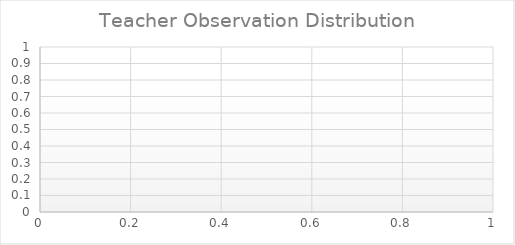
| Category | Distribution |
|---|---|
| #N/A | 0 |
| #N/A | 0 |
| #N/A | 0 |
| #N/A | 0 |
| #N/A | 0 |
| #N/A | 0 |
| #N/A | 0 |
| #N/A | 0 |
| #N/A | 0 |
| #N/A | 0 |
| #N/A | 0 |
| #N/A | 0 |
| #N/A | 0 |
| #N/A | 0 |
| #N/A | 0 |
| #N/A | 0 |
| #N/A | 0 |
| #N/A | 0 |
| #N/A | 0 |
| #N/A | 0 |
| #N/A | 0 |
| #N/A | 0 |
| #N/A | 0 |
| #N/A | 0 |
| #N/A | 0 |
| #N/A | 0 |
| #N/A | 0 |
| #N/A | 0 |
| #N/A | 0 |
| #N/A | 0 |
| #N/A | 0 |
| #N/A | 0 |
| #N/A | 0 |
| #N/A | 0 |
| #N/A | 0 |
| #N/A | 0 |
| #N/A | 0 |
| #N/A | 0 |
| #N/A | 0 |
| #N/A | 0 |
| #N/A | 0 |
| #N/A | 0 |
| #N/A | 0 |
| #N/A | 0 |
| #N/A | 0 |
| #N/A | 0 |
| #N/A | 0 |
| #N/A | 0 |
| #N/A | 0 |
| #N/A | 0 |
| #N/A | 0 |
| #N/A | 0 |
| #N/A | 0 |
| #N/A | 0 |
| #N/A | 0 |
| #N/A | 0 |
| #N/A | 0 |
| #N/A | 0 |
| #N/A | 0 |
| #N/A | 0 |
| #N/A | 0 |
| #N/A | 0 |
| #N/A | 0 |
| #N/A | 0 |
| #N/A | 0 |
| #N/A | 0 |
| #N/A | 0 |
| #N/A | 0 |
| #N/A | 0 |
| #N/A | 0 |
| #N/A | 0 |
| #N/A | 0 |
| #N/A | 0 |
| #N/A | 0 |
| #N/A | 0 |
| #N/A | 0 |
| #N/A | 0 |
| #N/A | 0 |
| #N/A | 0 |
| #N/A | 0 |
| #N/A | 0 |
| #N/A | 0 |
| #N/A | 0 |
| #N/A | 0 |
| #N/A | 0 |
| #N/A | 0 |
| #N/A | 0 |
| #N/A | 0 |
| #N/A | 0 |
| #N/A | 0 |
| #N/A | 0 |
| #N/A | 0 |
| #N/A | 0 |
| #N/A | 0 |
| #N/A | 0 |
| #N/A | 0 |
| #N/A | 0 |
| #N/A | 0 |
| #N/A | 0 |
| #N/A | 0 |
| #N/A | 0 |
| #N/A | 0 |
| #N/A | 0 |
| #N/A | 0 |
| #N/A | 0 |
| #N/A | 0 |
| #N/A | 0 |
| #N/A | 0 |
| #N/A | 0 |
| #N/A | 0 |
| #N/A | 0 |
| #N/A | 0 |
| #N/A | 0 |
| #N/A | 0 |
| #N/A | 0 |
| #N/A | 0 |
| #N/A | 0 |
| #N/A | 0 |
| #N/A | 0 |
| #N/A | 0 |
| #N/A | 0 |
| #N/A | 0 |
| #N/A | 0 |
| #N/A | 0 |
| #N/A | 0 |
| #N/A | 0 |
| #N/A | 0 |
| #N/A | 0 |
| #N/A | 0 |
| #N/A | 0 |
| #N/A | 0 |
| #N/A | 0 |
| #N/A | 0 |
| #N/A | 0 |
| #N/A | 0 |
| #N/A | 0 |
| #N/A | 0 |
| #N/A | 0 |
| #N/A | 0 |
| #N/A | 0 |
| #N/A | 0 |
| #N/A | 0 |
| #N/A | 0 |
| #N/A | 0 |
| #N/A | 0 |
| #N/A | 0 |
| #N/A | 0 |
| #N/A | 0 |
| #N/A | 0 |
| #N/A | 0 |
| #N/A | 0 |
| #N/A | 0 |
| #N/A | 0 |
| #N/A | 0 |
| #N/A | 0 |
| #N/A | 0 |
| #N/A | 0 |
| #N/A | 0 |
| #N/A | 0 |
| #N/A | 0 |
| #N/A | 0 |
| #N/A | 0 |
| #N/A | 0 |
| #N/A | 0 |
| #N/A | 0 |
| #N/A | 0 |
| #N/A | 0 |
| #N/A | 0 |
| #N/A | 0 |
| #N/A | 0 |
| #N/A | 0 |
| #N/A | 0 |
| #N/A | 0 |
| #N/A | 0 |
| #N/A | 0 |
| #N/A | 0 |
| #N/A | 0 |
| #N/A | 0 |
| #N/A | 0 |
| #N/A | 0 |
| #N/A | 0 |
| #N/A | 0 |
| #N/A | 0 |
| #N/A | 0 |
| #N/A | 0 |
| #N/A | 0 |
| #N/A | 0 |
| #N/A | 0 |
| #N/A | 0 |
| #N/A | 0 |
| #N/A | 0 |
| #N/A | 0 |
| #N/A | 0 |
| #N/A | 0 |
| #N/A | 0 |
| #N/A | 0 |
| #N/A | 0 |
| #N/A | 0 |
| #N/A | 0 |
| #N/A | 0 |
| #N/A | 0 |
| #N/A | 0 |
| #N/A | 0 |
| #N/A | 0 |
| #N/A | 0 |
| #N/A | 0 |
| #N/A | 0 |
| #N/A | 0 |
| #N/A | 0 |
| #N/A | 0 |
| #N/A | 0 |
| #N/A | 0 |
| #N/A | 0 |
| #N/A | 0 |
| #N/A | 0 |
| #N/A | 0 |
| #N/A | 0 |
| #N/A | 0 |
| #N/A | 0 |
| #N/A | 0 |
| #N/A | 0 |
| #N/A | 0 |
| #N/A | 0 |
| #N/A | 0 |
| #N/A | 0 |
| #N/A | 0 |
| #N/A | 0 |
| #N/A | 0 |
| #N/A | 0 |
| #N/A | 0 |
| #N/A | 0 |
| #N/A | 0 |
| #N/A | 0 |
| #N/A | 0 |
| #N/A | 0 |
| #N/A | 0 |
| #N/A | 0 |
| #N/A | 0 |
| #N/A | 0 |
| #N/A | 0 |
| #N/A | 0 |
| #N/A | 0 |
| #N/A | 0 |
| #N/A | 0 |
| #N/A | 0 |
| #N/A | 0 |
| #N/A | 0 |
| #N/A | 0 |
| #N/A | 0 |
| #N/A | 0 |
| #N/A | 0 |
| #N/A | 0 |
| #N/A | 0 |
| #N/A | 0 |
| #N/A | 0 |
| #N/A | 0 |
| #N/A | 0 |
| #N/A | 0 |
| #N/A | 0 |
| #N/A | 0 |
| #N/A | 0 |
| #N/A | 0 |
| #N/A | 0 |
| #N/A | 0 |
| #N/A | 0 |
| #N/A | 0 |
| #N/A | 0 |
| #N/A | 0 |
| #N/A | 0 |
| #N/A | 0 |
| #N/A | 0 |
| #N/A | 0 |
| #N/A | 0 |
| #N/A | 0 |
| #N/A | 0 |
| #N/A | 0 |
| #N/A | 0 |
| #N/A | 0 |
| #N/A | 0 |
| #N/A | 0 |
| #N/A | 0 |
| #N/A | 0 |
| #N/A | 0 |
| #N/A | 0 |
| #N/A | 0 |
| #N/A | 0 |
| #N/A | 0 |
| #N/A | 0 |
| #N/A | 0 |
| #N/A | 0 |
| #N/A | 0 |
| #N/A | 0 |
| #N/A | 0 |
| #N/A | 0 |
| #N/A | 0 |
| #N/A | 0 |
| #N/A | 0 |
| #N/A | 0 |
| #N/A | 0 |
| #N/A | 0 |
| #N/A | 0 |
| #N/A | 0 |
| #N/A | 0 |
| #N/A | 0 |
| #N/A | 0 |
| #N/A | 0 |
| #N/A | 0 |
| #N/A | 0 |
| #N/A | 0 |
| #N/A | 0 |
| #N/A | 0 |
| #N/A | 0 |
| #N/A | 0 |
| #N/A | 0 |
| #N/A | 0 |
| #N/A | 0 |
| #N/A | 0 |
| #N/A | 0 |
| #N/A | 0 |
| #N/A | 0 |
| #N/A | 0 |
| #N/A | 0 |
| #N/A | 0 |
| #N/A | 0 |
| #N/A | 0 |
| #N/A | 0 |
| #N/A | 0 |
| #N/A | 0 |
| #N/A | 0 |
| #N/A | 0 |
| #N/A | 0 |
| #N/A | 0 |
| #N/A | 0 |
| #N/A | 0 |
| #N/A | 0 |
| #N/A | 0 |
| #N/A | 0 |
| #N/A | 0 |
| #N/A | 0 |
| #N/A | 0 |
| #N/A | 0 |
| #N/A | 0 |
| #N/A | 0 |
| #N/A | 0 |
| #N/A | 0 |
| #N/A | 0 |
| #N/A | 0 |
| #N/A | 0 |
| #N/A | 0 |
| #N/A | 0 |
| #N/A | 0 |
| #N/A | 0 |
| #N/A | 0 |
| #N/A | 0 |
| #N/A | 0 |
| #N/A | 0 |
| #N/A | 0 |
| #N/A | 0 |
| #N/A | 0 |
| #N/A | 0 |
| #N/A | 0 |
| #N/A | 0 |
| #N/A | 0 |
| #N/A | 0 |
| #N/A | 0 |
| #N/A | 0 |
| #N/A | 0 |
| #N/A | 0 |
| #N/A | 0 |
| #N/A | 0 |
| #N/A | 0 |
| #N/A | 0 |
| #N/A | 0 |
| #N/A | 0 |
| #N/A | 0 |
| #N/A | 0 |
| #N/A | 0 |
| #N/A | 0 |
| #N/A | 0 |
| #N/A | 0 |
| #N/A | 0 |
| #N/A | 0 |
| #N/A | 0 |
| #N/A | 0 |
| #N/A | 0 |
| #N/A | 0 |
| #N/A | 0 |
| #N/A | 0 |
| #N/A | 0 |
| #N/A | 0 |
| #N/A | 0 |
| #N/A | 0 |
| #N/A | 0 |
| #N/A | 0 |
| #N/A | 0 |
| #N/A | 0 |
| #N/A | 0 |
| #N/A | 0 |
| #N/A | 0 |
| #N/A | 0 |
| #N/A | 0 |
| #N/A | 0 |
| #N/A | 0 |
| #N/A | 0 |
| #N/A | 0 |
| #N/A | 0 |
| #N/A | 0 |
| #N/A | 0 |
| #N/A | 0 |
| #N/A | 0 |
| #N/A | 0 |
| #N/A | 0 |
| #N/A | 0 |
| #N/A | 0 |
| #N/A | 0 |
| #N/A | 0 |
| #N/A | 0 |
| #N/A | 0 |
| #N/A | 0 |
| #N/A | 0 |
| #N/A | 0 |
| #N/A | 0 |
| #N/A | 0 |
| #N/A | 0 |
| #N/A | 0 |
| #N/A | 0 |
| #N/A | 0 |
| #N/A | 0 |
| #N/A | 0 |
| #N/A | 0 |
| #N/A | 0 |
| #N/A | 0 |
| #N/A | 0 |
| #N/A | 0 |
| #N/A | 0 |
| #N/A | 0 |
| #N/A | 0 |
| #N/A | 0 |
| #N/A | 0 |
| #N/A | 0 |
| #N/A | 0 |
| #N/A | 0 |
| #N/A | 0 |
| #N/A | 0 |
| #N/A | 0 |
| #N/A | 0 |
| #N/A | 0 |
| #N/A | 0 |
| #N/A | 0 |
| #N/A | 0 |
| #N/A | 0 |
| #N/A | 0 |
| #N/A | 0 |
| #N/A | 0 |
| #N/A | 0 |
| #N/A | 0 |
| #N/A | 0 |
| #N/A | 0 |
| #N/A | 0 |
| #N/A | 0 |
| #N/A | 0 |
| #N/A | 0 |
| #N/A | 0 |
| #N/A | 0 |
| #N/A | 0 |
| #N/A | 0 |
| #N/A | 0 |
| #N/A | 0 |
| #N/A | 0 |
| #N/A | 0 |
| #N/A | 0 |
| #N/A | 0 |
| #N/A | 0 |
| #N/A | 0 |
| #N/A | 0 |
| #N/A | 0 |
| #N/A | 0 |
| #N/A | 0 |
| #N/A | 0 |
| #N/A | 0 |
| #N/A | 0 |
| #N/A | 0 |
| #N/A | 0 |
| #N/A | 0 |
| #N/A | 0 |
| #N/A | 0 |
| #N/A | 0 |
| #N/A | 0 |
| #N/A | 0 |
| #N/A | 0 |
| #N/A | 0 |
| #N/A | 0 |
| #N/A | 0 |
| #N/A | 0 |
| #N/A | 0 |
| #N/A | 0 |
| #N/A | 0 |
| #N/A | 0 |
| #N/A | 0 |
| #N/A | 0 |
| #N/A | 0 |
| #N/A | 0 |
| #N/A | 0 |
| #N/A | 0 |
| #N/A | 0 |
| #N/A | 0 |
| #N/A | 0 |
| #N/A | 0 |
| #N/A | 0 |
| #N/A | 0 |
| #N/A | 0 |
| #N/A | 0 |
| #N/A | 0 |
| #N/A | 0 |
| #N/A | 0 |
| #N/A | 0 |
| #N/A | 0 |
| #N/A | 0 |
| #N/A | 0 |
| #N/A | 0 |
| #N/A | 0 |
| #N/A | 0 |
| #N/A | 0 |
| #N/A | 0 |
| #N/A | 0 |
| #N/A | 0 |
| #N/A | 0 |
| #N/A | 0 |
| #N/A | 0 |
| #N/A | 0 |
| #N/A | 0 |
| #N/A | 0 |
| #N/A | 0 |
| #N/A | 0 |
| #N/A | 0 |
| #N/A | 0 |
| #N/A | 0 |
| #N/A | 0 |
| #N/A | 0 |
| #N/A | 0 |
| #N/A | 0 |
| #N/A | 0 |
| #N/A | 0 |
| #N/A | 0 |
| #N/A | 0 |
| #N/A | 0 |
| #N/A | 0 |
| #N/A | 0 |
| #N/A | 0 |
| #N/A | 0 |
| #N/A | 0 |
| #N/A | 0 |
| #N/A | 0 |
| #N/A | 0 |
| #N/A | 0 |
| #N/A | 0 |
| #N/A | 0 |
| #N/A | 0 |
| #N/A | 0 |
| #N/A | 0 |
| #N/A | 0 |
| #N/A | 0 |
| #N/A | 0 |
| #N/A | 0 |
| #N/A | 0 |
| #N/A | 0 |
| #N/A | 0 |
| #N/A | 0 |
| #N/A | 0 |
| #N/A | 0 |
| #N/A | 0 |
| #N/A | 0 |
| #N/A | 0 |
| #N/A | 0 |
| #N/A | 0 |
| #N/A | 0 |
| #N/A | 0 |
| #N/A | 0 |
| #N/A | 0 |
| #N/A | 0 |
| #N/A | 0 |
| #N/A | 0 |
| #N/A | 0 |
| #N/A | 0 |
| #N/A | 0 |
| #N/A | 0 |
| #N/A | 0 |
| #N/A | 0 |
| #N/A | 0 |
| #N/A | 0 |
| #N/A | 0 |
| #N/A | 0 |
| #N/A | 0 |
| #N/A | 0 |
| #N/A | 0 |
| #N/A | 0 |
| #N/A | 0 |
| #N/A | 0 |
| #N/A | 0 |
| #N/A | 0 |
| #N/A | 0 |
| #N/A | 0 |
| #N/A | 0 |
| #N/A | 0 |
| #N/A | 0 |
| #N/A | 0 |
| #N/A | 0 |
| #N/A | 0 |
| #N/A | 0 |
| #N/A | 0 |
| #N/A | 0 |
| #N/A | 0 |
| #N/A | 0 |
| #N/A | 0 |
| #N/A | 0 |
| #N/A | 0 |
| #N/A | 0 |
| #N/A | 0 |
| #N/A | 0 |
| #N/A | 0 |
| #N/A | 0 |
| #N/A | 0 |
| #N/A | 0 |
| #N/A | 0 |
| #N/A | 0 |
| #N/A | 0 |
| #N/A | 0 |
| #N/A | 0 |
| #N/A | 0 |
| #N/A | 0 |
| #N/A | 0 |
| #N/A | 0 |
| #N/A | 0 |
| #N/A | 0 |
| #N/A | 0 |
| #N/A | 0 |
| #N/A | 0 |
| #N/A | 0 |
| #N/A | 0 |
| #N/A | 0 |
| #N/A | 0 |
| #N/A | 0 |
| #N/A | 0 |
| #N/A | 0 |
| #N/A | 0 |
| #N/A | 0 |
| #N/A | 0 |
| #N/A | 0 |
| #N/A | 0 |
| #N/A | 0 |
| #N/A | 0 |
| #N/A | 0 |
| #N/A | 0 |
| #N/A | 0 |
| #N/A | 0 |
| #N/A | 0 |
| #N/A | 0 |
| #N/A | 0 |
| #N/A | 0 |
| #N/A | 0 |
| #N/A | 0 |
| #N/A | 0 |
| #N/A | 0 |
| #N/A | 0 |
| #N/A | 0 |
| #N/A | 0 |
| #N/A | 0 |
| #N/A | 0 |
| #N/A | 0 |
| #N/A | 0 |
| #N/A | 0 |
| #N/A | 0 |
| #N/A | 0 |
| #N/A | 0 |
| #N/A | 0 |
| #N/A | 0 |
| #N/A | 0 |
| #N/A | 0 |
| #N/A | 0 |
| #N/A | 0 |
| #N/A | 0 |
| #N/A | 0 |
| #N/A | 0 |
| #N/A | 0 |
| #N/A | 0 |
| #N/A | 0 |
| #N/A | 0 |
| #N/A | 0 |
| #N/A | 0 |
| #N/A | 0 |
| #N/A | 0 |
| #N/A | 0 |
| #N/A | 0 |
| #N/A | 0 |
| #N/A | 0 |
| #N/A | 0 |
| #N/A | 0 |
| #N/A | 0 |
| #N/A | 0 |
| #N/A | 0 |
| #N/A | 0 |
| #N/A | 0 |
| #N/A | 0 |
| #N/A | 0 |
| #N/A | 0 |
| #N/A | 0 |
| #N/A | 0 |
| #N/A | 0 |
| #N/A | 0 |
| #N/A | 0 |
| #N/A | 0 |
| #N/A | 0 |
| #N/A | 0 |
| #N/A | 0 |
| #N/A | 0 |
| #N/A | 0 |
| #N/A | 0 |
| #N/A | 0 |
| #N/A | 0 |
| #N/A | 0 |
| #N/A | 0 |
| #N/A | 0 |
| #N/A | 0 |
| #N/A | 0 |
| #N/A | 0 |
| #N/A | 0 |
| #N/A | 0 |
| #N/A | 0 |
| #N/A | 0 |
| #N/A | 0 |
| #N/A | 0 |
| #N/A | 0 |
| #N/A | 0 |
| #N/A | 0 |
| #N/A | 0 |
| #N/A | 0 |
| #N/A | 0 |
| #N/A | 0 |
| #N/A | 0 |
| #N/A | 0 |
| #N/A | 0 |
| #N/A | 0 |
| #N/A | 0 |
| #N/A | 0 |
| #N/A | 0 |
| #N/A | 0 |
| #N/A | 0 |
| #N/A | 0 |
| #N/A | 0 |
| #N/A | 0 |
| #N/A | 0 |
| #N/A | 0 |
| #N/A | 0 |
| #N/A | 0 |
| #N/A | 0 |
| #N/A | 0 |
| #N/A | 0 |
| #N/A | 0 |
| #N/A | 0 |
| #N/A | 0 |
| #N/A | 0 |
| #N/A | 0 |
| #N/A | 0 |
| #N/A | 0 |
| #N/A | 0 |
| #N/A | 0 |
| #N/A | 0 |
| #N/A | 0 |
| #N/A | 0 |
| #N/A | 0 |
| #N/A | 0 |
| #N/A | 0 |
| #N/A | 0 |
| #N/A | 0 |
| #N/A | 0 |
| #N/A | 0 |
| #N/A | 0 |
| #N/A | 0 |
| #N/A | 0 |
| #N/A | 0 |
| #N/A | 0 |
| #N/A | 0 |
| #N/A | 0 |
| #N/A | 0 |
| #N/A | 0 |
| #N/A | 0 |
| #N/A | 0 |
| #N/A | 0 |
| #N/A | 0 |
| #N/A | 0 |
| #N/A | 0 |
| #N/A | 0 |
| #N/A | 0 |
| #N/A | 0 |
| #N/A | 0 |
| #N/A | 0 |
| #N/A | 0 |
| #N/A | 0 |
| #N/A | 0 |
| #N/A | 0 |
| #N/A | 0 |
| #N/A | 0 |
| #N/A | 0 |
| #N/A | 0 |
| #N/A | 0 |
| #N/A | 0 |
| #N/A | 0 |
| #N/A | 0 |
| #N/A | 0 |
| #N/A | 0 |
| #N/A | 0 |
| #N/A | 0 |
| #N/A | 0 |
| #N/A | 0 |
| #N/A | 0 |
| #N/A | 0 |
| #N/A | 0 |
| #N/A | 0 |
| #N/A | 0 |
| #N/A | 0 |
| #N/A | 0 |
| #N/A | 0 |
| #N/A | 0 |
| #N/A | 0 |
| #N/A | 0 |
| #N/A | 0 |
| #N/A | 0 |
| #N/A | 0 |
| #N/A | 0 |
| #N/A | 0 |
| #N/A | 0 |
| #N/A | 0 |
| #N/A | 0 |
| #N/A | 0 |
| #N/A | 0 |
| #N/A | 0 |
| #N/A | 0 |
| #N/A | 0 |
| #N/A | 0 |
| #N/A | 0 |
| #N/A | 0 |
| #N/A | 0 |
| #N/A | 0 |
| #N/A | 0 |
| #N/A | 0 |
| #N/A | 0 |
| #N/A | 0 |
| #N/A | 0 |
| #N/A | 0 |
| #N/A | 0 |
| #N/A | 0 |
| #N/A | 0 |
| #N/A | 0 |
| #N/A | 0 |
| #N/A | 0 |
| #N/A | 0 |
| #N/A | 0 |
| #N/A | 0 |
| #N/A | 0 |
| #N/A | 0 |
| #N/A | 0 |
| #N/A | 0 |
| #N/A | 0 |
| #N/A | 0 |
| #N/A | 0 |
| #N/A | 0 |
| #N/A | 0 |
| #N/A | 0 |
| #N/A | 0 |
| #N/A | 0 |
| #N/A | 0 |
| #N/A | 0 |
| #N/A | 0 |
| #N/A | 0 |
| #N/A | 0 |
| #N/A | 0 |
| #N/A | 0 |
| #N/A | 0 |
| #N/A | 0 |
| #N/A | 0 |
| #N/A | 0 |
| #N/A | 0 |
| #N/A | 0 |
| #N/A | 0 |
| #N/A | 0 |
| #N/A | 0 |
| #N/A | 0 |
| #N/A | 0 |
| #N/A | 0 |
| #N/A | 0 |
| #N/A | 0 |
| #N/A | 0 |
| #N/A | 0 |
| #N/A | 0 |
| #N/A | 0 |
| #N/A | 0 |
| #N/A | 0 |
| #N/A | 0 |
| #N/A | 0 |
| #N/A | 0 |
| #N/A | 0 |
| #N/A | 0 |
| #N/A | 0 |
| #N/A | 0 |
| #N/A | 0 |
| #N/A | 0 |
| #N/A | 0 |
| #N/A | 0 |
| #N/A | 0 |
| #N/A | 0 |
| #N/A | 0 |
| #N/A | 0 |
| #N/A | 0 |
| #N/A | 0 |
| #N/A | 0 |
| #N/A | 0 |
| #N/A | 0 |
| #N/A | 0 |
| #N/A | 0 |
| #N/A | 0 |
| #N/A | 0 |
| #N/A | 0 |
| #N/A | 0 |
| #N/A | 0 |
| #N/A | 0 |
| #N/A | 0 |
| #N/A | 0 |
| #N/A | 0 |
| #N/A | 0 |
| #N/A | 0 |
| #N/A | 0 |
| #N/A | 0 |
| #N/A | 0 |
| #N/A | 0 |
| #N/A | 0 |
| #N/A | 0 |
| #N/A | 0 |
| #N/A | 0 |
| #N/A | 0 |
| #N/A | 0 |
| #N/A | 0 |
| #N/A | 0 |
| #N/A | 0 |
| #N/A | 0 |
| #N/A | 0 |
| #N/A | 0 |
| #N/A | 0 |
| #N/A | 0 |
| #N/A | 0 |
| #N/A | 0 |
| #N/A | 0 |
| #N/A | 0 |
| #N/A | 0 |
| #N/A | 0 |
| #N/A | 0 |
| #N/A | 0 |
| #N/A | 0 |
| #N/A | 0 |
| #N/A | 0 |
| #N/A | 0 |
| #N/A | 0 |
| #N/A | 0 |
| #N/A | 0 |
| #N/A | 0 |
| #N/A | 0 |
| #N/A | 0 |
| #N/A | 0 |
| #N/A | 0 |
| #N/A | 0 |
| #N/A | 0 |
| #N/A | 0 |
| #N/A | 0 |
| #N/A | 0 |
| #N/A | 0 |
| #N/A | 0 |
| #N/A | 0 |
| #N/A | 0 |
| #N/A | 0 |
| #N/A | 0 |
| #N/A | 0 |
| #N/A | 0 |
| #N/A | 0 |
| #N/A | 0 |
| #N/A | 0 |
| #N/A | 0 |
| #N/A | 0 |
| #N/A | 0 |
| #N/A | 0 |
| #N/A | 0 |
| #N/A | 0 |
| #N/A | 0 |
| #N/A | 0 |
| #N/A | 0 |
| #N/A | 0 |
| #N/A | 0 |
| #N/A | 0 |
| #N/A | 0 |
| #N/A | 0 |
| #N/A | 0 |
| #N/A | 0 |
| #N/A | 0 |
| #N/A | 0 |
| #N/A | 0 |
| #N/A | 0 |
| #N/A | 0 |
| #N/A | 0 |
| #N/A | 0 |
| #N/A | 0 |
| #N/A | 0 |
| #N/A | 0 |
| #N/A | 0 |
| #N/A | 0 |
| #N/A | 0 |
| #N/A | 0 |
| #N/A | 0 |
| #N/A | 0 |
| #N/A | 0 |
| #N/A | 0 |
| #N/A | 0 |
| #N/A | 0 |
| #N/A | 0 |
| #N/A | 0 |
| #N/A | 0 |
| #N/A | 0 |
| #N/A | 0 |
| #N/A | 0 |
| #N/A | 0 |
| #N/A | 0 |
| #N/A | 0 |
| #N/A | 0 |
| #N/A | 0 |
| #N/A | 0 |
| #N/A | 0 |
| #N/A | 0 |
| #N/A | 0 |
| #N/A | 0 |
| #N/A | 0 |
| #N/A | 0 |
| #N/A | 0 |
| #N/A | 0 |
| #N/A | 0 |
| #N/A | 0 |
| #N/A | 0 |
| #N/A | 0 |
| #N/A | 0 |
| #N/A | 0 |
| #N/A | 0 |
| #N/A | 0 |
| #N/A | 0 |
| #N/A | 0 |
| #N/A | 0 |
| #N/A | 0 |
| #N/A | 0 |
| #N/A | 0 |
| #N/A | 0 |
| #N/A | 0 |
| #N/A | 0 |
| #N/A | 0 |
| #N/A | 0 |
| #N/A | 0 |
| #N/A | 0 |
| #N/A | 0 |
| #N/A | 0 |
| #N/A | 0 |
| #N/A | 0 |
| #N/A | 0 |
| #N/A | 0 |
| #N/A | 0 |
| #N/A | 0 |
| #N/A | 0 |
| #N/A | 0 |
| #N/A | 0 |
| #N/A | 0 |
| #N/A | 0 |
| #N/A | 0 |
| #N/A | 0 |
| #N/A | 0 |
| #N/A | 0 |
| #N/A | 0 |
| #N/A | 0 |
| #N/A | 0 |
| #N/A | 0 |
| #N/A | 0 |
| #N/A | 0 |
| #N/A | 0 |
| #N/A | 0 |
| #N/A | 0 |
| #N/A | 0 |
| #N/A | 0 |
| #N/A | 0 |
| #N/A | 0 |
| #N/A | 0 |
| #N/A | 0 |
| #N/A | 0 |
| #N/A | 0 |
| #N/A | 0 |
| #N/A | 0 |
| #N/A | 0 |
| #N/A | 0 |
| #N/A | 0 |
| #N/A | 0 |
| #N/A | 0 |
| #N/A | 0 |
| #N/A | 0 |
| #N/A | 0 |
| #N/A | 0 |
| #N/A | 0 |
| #N/A | 0 |
| #N/A | 0 |
| #N/A | 0 |
| #N/A | 0 |
| #N/A | 0 |
| #N/A | 0 |
| #N/A | 0 |
| #N/A | 0 |
| #N/A | 0 |
| #N/A | 0 |
| #N/A | 0 |
| #N/A | 0 |
| #N/A | 0 |
| #N/A | 0 |
| #N/A | 0 |
| #N/A | 0 |
| #N/A | 0 |
| #N/A | 0 |
| #N/A | 0 |
| #N/A | 0 |
| #N/A | 0 |
| #N/A | 0 |
| #N/A | 0 |
| #N/A | 0 |
| #N/A | 0 |
| #N/A | 0 |
| #N/A | 0 |
| #N/A | 0 |
| #N/A | 0 |
| #N/A | 0 |
| #N/A | 0 |
| #N/A | 0 |
| #N/A | 0 |
| #N/A | 0 |
| #N/A | 0 |
| #N/A | 0 |
| #N/A | 0 |
| #N/A | 0 |
| #N/A | 0 |
| #N/A | 0 |
| #N/A | 0 |
| #N/A | 0 |
| #N/A | 0 |
| #N/A | 0 |
| #N/A | 0 |
| #N/A | 0 |
| #N/A | 0 |
| #N/A | 0 |
| #N/A | 0 |
| #N/A | 0 |
| #N/A | 0 |
| #N/A | 0 |
| #N/A | 0 |
| #N/A | 0 |
| #N/A | 0 |
| #N/A | 0 |
| #N/A | 0 |
| #N/A | 0 |
| #N/A | 0 |
| #N/A | 0 |
| #N/A | 0 |
| #N/A | 0 |
| #N/A | 0 |
| #N/A | 0 |
| #N/A | 0 |
| #N/A | 0 |
| #N/A | 0 |
| #N/A | 0 |
| #N/A | 0 |
| #N/A | 0 |
| #N/A | 0 |
| #N/A | 0 |
| #N/A | 0 |
| #N/A | 0 |
| #N/A | 0 |
| #N/A | 0 |
| #N/A | 0 |
| #N/A | 0 |
| #N/A | 0 |
| #N/A | 0 |
| #N/A | 0 |
| #N/A | 0 |
| #N/A | 0 |
| #N/A | 0 |
| #N/A | 0 |
| #N/A | 0 |
| #N/A | 0 |
| #N/A | 0 |
| #N/A | 0 |
| #N/A | 0 |
| #N/A | 0 |
| #N/A | 0 |
| #N/A | 0 |
| #N/A | 0 |
| #N/A | 0 |
| #N/A | 0 |
| #N/A | 0 |
| #N/A | 0 |
| #N/A | 0 |
| #N/A | 0 |
| #N/A | 0 |
| #N/A | 0 |
| #N/A | 0 |
| #N/A | 0 |
| #N/A | 0 |
| #N/A | 0 |
| #N/A | 0 |
| #N/A | 0 |
| #N/A | 0 |
| #N/A | 0 |
| #N/A | 0 |
| #N/A | 0 |
| #N/A | 0 |
| #N/A | 0 |
| #N/A | 0 |
| #N/A | 0 |
| #N/A | 0 |
| #N/A | 0 |
| #N/A | 0 |
| #N/A | 0 |
| #N/A | 0 |
| #N/A | 0 |
| #N/A | 0 |
| #N/A | 0 |
| #N/A | 0 |
| #N/A | 0 |
| #N/A | 0 |
| #N/A | 0 |
| #N/A | 0 |
| #N/A | 0 |
| #N/A | 0 |
| #N/A | 0 |
| #N/A | 0 |
| #N/A | 0 |
| #N/A | 0 |
| #N/A | 0 |
| #N/A | 0 |
| #N/A | 0 |
| #N/A | 0 |
| #N/A | 0 |
| #N/A | 0 |
| #N/A | 0 |
| #N/A | 0 |
| #N/A | 0 |
| #N/A | 0 |
| #N/A | 0 |
| #N/A | 0 |
| #N/A | 0 |
| #N/A | 0 |
| #N/A | 0 |
| #N/A | 0 |
| #N/A | 0 |
| #N/A | 0 |
| #N/A | 0 |
| #N/A | 0 |
| #N/A | 0 |
| #N/A | 0 |
| #N/A | 0 |
| #N/A | 0 |
| #N/A | 0 |
| #N/A | 0 |
| #N/A | 0 |
| #N/A | 0 |
| #N/A | 0 |
| #N/A | 0 |
| #N/A | 0 |
| #N/A | 0 |
| #N/A | 0 |
| #N/A | 0 |
| #N/A | 0 |
| #N/A | 0 |
| #N/A | 0 |
| #N/A | 0 |
| #N/A | 0 |
| #N/A | 0 |
| #N/A | 0 |
| #N/A | 0 |
| #N/A | 0 |
| #N/A | 0 |
| #N/A | 0 |
| #N/A | 0 |
| #N/A | 0 |
| #N/A | 0 |
| #N/A | 0 |
| #N/A | 0 |
| #N/A | 0 |
| #N/A | 0 |
| #N/A | 0 |
| #N/A | 0 |
| #N/A | 0 |
| #N/A | 0 |
| #N/A | 0 |
| #N/A | 0 |
| #N/A | 0 |
| #N/A | 0 |
| #N/A | 0 |
| #N/A | 0 |
| #N/A | 0 |
| #N/A | 0 |
| #N/A | 0 |
| #N/A | 0 |
| #N/A | 0 |
| #N/A | 0 |
| #N/A | 0 |
| #N/A | 0 |
| #N/A | 0 |
| #N/A | 0 |
| #N/A | 0 |
| #N/A | 0 |
| #N/A | 0 |
| #N/A | 0 |
| #N/A | 0 |
| #N/A | 0 |
| #N/A | 0 |
| #N/A | 0 |
| #N/A | 0 |
| #N/A | 0 |
| #N/A | 0 |
| #N/A | 0 |
| #N/A | 0 |
| #N/A | 0 |
| #N/A | 0 |
| #N/A | 0 |
| #N/A | 0 |
| #N/A | 0 |
| #N/A | 0 |
| #N/A | 0 |
| #N/A | 0 |
| #N/A | 0 |
| #N/A | 0 |
| #N/A | 0 |
| #N/A | 0 |
| #N/A | 0 |
| #N/A | 0 |
| #N/A | 0 |
| #N/A | 0 |
| #N/A | 0 |
| #N/A | 0 |
| #N/A | 0 |
| #N/A | 0 |
| #N/A | 0 |
| #N/A | 0 |
| #N/A | 0 |
| #N/A | 0 |
| #N/A | 0 |
| #N/A | 0 |
| #N/A | 0 |
| #N/A | 0 |
| #N/A | 0 |
| #N/A | 0 |
| #N/A | 0 |
| #N/A | 0 |
| #N/A | 0 |
| #N/A | 0 |
| #N/A | 0 |
| #N/A | 0 |
| #N/A | 0 |
| #N/A | 0 |
| #N/A | 0 |
| #N/A | 0 |
| #N/A | 0 |
| #N/A | 0 |
| #N/A | 0 |
| #N/A | 0 |
| #N/A | 0 |
| #N/A | 0 |
| #N/A | 0 |
| #N/A | 0 |
| #N/A | 0 |
| #N/A | 0 |
| #N/A | 0 |
| #N/A | 0 |
| #N/A | 0 |
| #N/A | 0 |
| #N/A | 0 |
| #N/A | 0 |
| #N/A | 0 |
| #N/A | 0 |
| #N/A | 0 |
| #N/A | 0 |
| #N/A | 0 |
| #N/A | 0 |
| #N/A | 0 |
| #N/A | 0 |
| #N/A | 0 |
| #N/A | 0 |
| #N/A | 0 |
| #N/A | 0 |
| #N/A | 0 |
| #N/A | 0 |
| #N/A | 0 |
| #N/A | 0 |
| #N/A | 0 |
| #N/A | 0 |
| #N/A | 0 |
| #N/A | 0 |
| #N/A | 0 |
| #N/A | 0 |
| #N/A | 0 |
| #N/A | 0 |
| #N/A | 0 |
| #N/A | 0 |
| #N/A | 0 |
| #N/A | 0 |
| #N/A | 0 |
| #N/A | 0 |
| #N/A | 0 |
| #N/A | 0 |
| #N/A | 0 |
| #N/A | 0 |
| #N/A | 0 |
| #N/A | 0 |
| #N/A | 0 |
| #N/A | 0 |
| #N/A | 0 |
| #N/A | 0 |
| #N/A | 0 |
| #N/A | 0 |
| #N/A | 0 |
| #N/A | 0 |
| #N/A | 0 |
| #N/A | 0 |
| #N/A | 0 |
| #N/A | 0 |
| #N/A | 0 |
| #N/A | 0 |
| #N/A | 0 |
| #N/A | 0 |
| #N/A | 0 |
| #N/A | 0 |
| #N/A | 0 |
| #N/A | 0 |
| #N/A | 0 |
| #N/A | 0 |
| #N/A | 0 |
| #N/A | 0 |
| #N/A | 0 |
| #N/A | 0 |
| #N/A | 0 |
| #N/A | 0 |
| #N/A | 0 |
| #N/A | 0 |
| #N/A | 0 |
| #N/A | 0 |
| #N/A | 0 |
| #N/A | 0 |
| #N/A | 0 |
| #N/A | 0 |
| #N/A | 0 |
| #N/A | 0 |
| #N/A | 0 |
| #N/A | 0 |
| #N/A | 0 |
| #N/A | 0 |
| #N/A | 0 |
| #N/A | 0 |
| #N/A | 0 |
| #N/A | 0 |
| #N/A | 0 |
| #N/A | 0 |
| #N/A | 0 |
| #N/A | 0 |
| #N/A | 0 |
| #N/A | 0 |
| #N/A | 0 |
| #N/A | 0 |
| #N/A | 0 |
| #N/A | 0 |
| #N/A | 0 |
| #N/A | 0 |
| #N/A | 0 |
| #N/A | 0 |
| #N/A | 0 |
| #N/A | 0 |
| #N/A | 0 |
| #N/A | 0 |
| #N/A | 0 |
| #N/A | 0 |
| #N/A | 0 |
| #N/A | 0 |
| #N/A | 0 |
| #N/A | 0 |
| #N/A | 0 |
| #N/A | 0 |
| #N/A | 0 |
| #N/A | 0 |
| #N/A | 0 |
| #N/A | 0 |
| #N/A | 0 |
| #N/A | 0 |
| #N/A | 0 |
| #N/A | 0 |
| #N/A | 0 |
| #N/A | 0 |
| #N/A | 0 |
| #N/A | 0 |
| #N/A | 0 |
| #N/A | 0 |
| #N/A | 0 |
| #N/A | 0 |
| #N/A | 0 |
| #N/A | 0 |
| #N/A | 0 |
| #N/A | 0 |
| #N/A | 0 |
| #N/A | 0 |
| #N/A | 0 |
| #N/A | 0 |
| #N/A | 0 |
| #N/A | 0 |
| #N/A | 0 |
| #N/A | 0 |
| #N/A | 0 |
| #N/A | 0 |
| #N/A | 0 |
| #N/A | 0 |
| #N/A | 0 |
| #N/A | 0 |
| #N/A | 0 |
| #N/A | 0 |
| #N/A | 0 |
| #N/A | 0 |
| #N/A | 0 |
| #N/A | 0 |
| #N/A | 0 |
| #N/A | 0 |
| #N/A | 0 |
| #N/A | 0 |
| #N/A | 0 |
| #N/A | 0 |
| #N/A | 0 |
| #N/A | 0 |
| #N/A | 0 |
| #N/A | 0 |
| #N/A | 0 |
| #N/A | 0 |
| #N/A | 0 |
| #N/A | 0 |
| #N/A | 0 |
| #N/A | 0 |
| #N/A | 0 |
| #N/A | 0 |
| #N/A | 0 |
| #N/A | 0 |
| #N/A | 0 |
| #N/A | 0 |
| #N/A | 0 |
| #N/A | 0 |
| #N/A | 0 |
| #N/A | 0 |
| #N/A | 0 |
| #N/A | 0 |
| #N/A | 0 |
| #N/A | 0 |
| #N/A | 0 |
| #N/A | 0 |
| #N/A | 0 |
| #N/A | 0 |
| #N/A | 0 |
| #N/A | 0 |
| #N/A | 0 |
| #N/A | 0 |
| #N/A | 0 |
| #N/A | 0 |
| #N/A | 0 |
| #N/A | 0 |
| #N/A | 0 |
| #N/A | 0 |
| #N/A | 0 |
| #N/A | 0 |
| #N/A | 0 |
| #N/A | 0 |
| #N/A | 0 |
| #N/A | 0 |
| #N/A | 0 |
| #N/A | 0 |
| #N/A | 0 |
| #N/A | 0 |
| #N/A | 0 |
| #N/A | 0 |
| #N/A | 0 |
| #N/A | 0 |
| #N/A | 0 |
| #N/A | 0 |
| #N/A | 0 |
| #N/A | 0 |
| #N/A | 0 |
| #N/A | 0 |
| #N/A | 0 |
| #N/A | 0 |
| #N/A | 0 |
| #N/A | 0 |
| #N/A | 0 |
| #N/A | 0 |
| #N/A | 0 |
| #N/A | 0 |
| #N/A | 0 |
| #N/A | 0 |
| #N/A | 0 |
| #N/A | 0 |
| #N/A | 0 |
| #N/A | 0 |
| #N/A | 0 |
| #N/A | 0 |
| #N/A | 0 |
| #N/A | 0 |
| #N/A | 0 |
| #N/A | 0 |
| #N/A | 0 |
| #N/A | 0 |
| #N/A | 0 |
| #N/A | 0 |
| #N/A | 0 |
| #N/A | 0 |
| #N/A | 0 |
| #N/A | 0 |
| #N/A | 0 |
| #N/A | 0 |
| #N/A | 0 |
| #N/A | 0 |
| #N/A | 0 |
| #N/A | 0 |
| #N/A | 0 |
| #N/A | 0 |
| #N/A | 0 |
| #N/A | 0 |
| #N/A | 0 |
| #N/A | 0 |
| #N/A | 0 |
| #N/A | 0 |
| #N/A | 0 |
| #N/A | 0 |
| #N/A | 0 |
| #N/A | 0 |
| #N/A | 0 |
| #N/A | 0 |
| #N/A | 0 |
| #N/A | 0 |
| #N/A | 0 |
| #N/A | 0 |
| #N/A | 0 |
| #N/A | 0 |
| #N/A | 0 |
| #N/A | 0 |
| #N/A | 0 |
| #N/A | 0 |
| #N/A | 0 |
| #N/A | 0 |
| #N/A | 0 |
| #N/A | 0 |
| #N/A | 0 |
| #N/A | 0 |
| #N/A | 0 |
| #N/A | 0 |
| #N/A | 0 |
| #N/A | 0 |
| #N/A | 0 |
| #N/A | 0 |
| #N/A | 0 |
| #N/A | 0 |
| #N/A | 0 |
| #N/A | 0 |
| #N/A | 0 |
| #N/A | 0 |
| #N/A | 0 |
| #N/A | 0 |
| #N/A | 0 |
| #N/A | 0 |
| #N/A | 0 |
| #N/A | 0 |
| #N/A | 0 |
| #N/A | 0 |
| #N/A | 0 |
| #N/A | 0 |
| #N/A | 0 |
| #N/A | 0 |
| #N/A | 0 |
| #N/A | 0 |
| #N/A | 0 |
| #N/A | 0 |
| #N/A | 0 |
| #N/A | 0 |
| #N/A | 0 |
| #N/A | 0 |
| #N/A | 0 |
| #N/A | 0 |
| #N/A | 0 |
| #N/A | 0 |
| #N/A | 0 |
| #N/A | 0 |
| #N/A | 0 |
| #N/A | 0 |
| #N/A | 0 |
| #N/A | 0 |
| #N/A | 0 |
| #N/A | 0 |
| #N/A | 0 |
| #N/A | 0 |
| #N/A | 0 |
| #N/A | 0 |
| #N/A | 0 |
| #N/A | 0 |
| #N/A | 0 |
| #N/A | 0 |
| #N/A | 0 |
| #N/A | 0 |
| #N/A | 0 |
| #N/A | 0 |
| #N/A | 0 |
| #N/A | 0 |
| #N/A | 0 |
| #N/A | 0 |
| #N/A | 0 |
| #N/A | 0 |
| #N/A | 0 |
| #N/A | 0 |
| #N/A | 0 |
| #N/A | 0 |
| #N/A | 0 |
| #N/A | 0 |
| #N/A | 0 |
| #N/A | 0 |
| #N/A | 0 |
| #N/A | 0 |
| #N/A | 0 |
| #N/A | 0 |
| #N/A | 0 |
| #N/A | 0 |
| #N/A | 0 |
| #N/A | 0 |
| #N/A | 0 |
| #N/A | 0 |
| #N/A | 0 |
| #N/A | 0 |
| #N/A | 0 |
| #N/A | 0 |
| #N/A | 0 |
| #N/A | 0 |
| #N/A | 0 |
| #N/A | 0 |
| #N/A | 0 |
| #N/A | 0 |
| #N/A | 0 |
| #N/A | 0 |
| #N/A | 0 |
| #N/A | 0 |
| #N/A | 0 |
| #N/A | 0 |
| #N/A | 0 |
| #N/A | 0 |
| #N/A | 0 |
| #N/A | 0 |
| #N/A | 0 |
| #N/A | 0 |
| #N/A | 0 |
| #N/A | 0 |
| #N/A | 0 |
| #N/A | 0 |
| #N/A | 0 |
| #N/A | 0 |
| #N/A | 0 |
| #N/A | 0 |
| #N/A | 0 |
| #N/A | 0 |
| #N/A | 0 |
| #N/A | 0 |
| #N/A | 0 |
| #N/A | 0 |
| #N/A | 0 |
| #N/A | 0 |
| #N/A | 0 |
| #N/A | 0 |
| #N/A | 0 |
| #N/A | 0 |
| #N/A | 0 |
| #N/A | 0 |
| #N/A | 0 |
| #N/A | 0 |
| #N/A | 0 |
| #N/A | 0 |
| #N/A | 0 |
| #N/A | 0 |
| #N/A | 0 |
| #N/A | 0 |
| #N/A | 0 |
| #N/A | 0 |
| #N/A | 0 |
| #N/A | 0 |
| #N/A | 0 |
| #N/A | 0 |
| #N/A | 0 |
| #N/A | 0 |
| #N/A | 0 |
| #N/A | 0 |
| #N/A | 0 |
| #N/A | 0 |
| #N/A | 0 |
| #N/A | 0 |
| #N/A | 0 |
| #N/A | 0 |
| #N/A | 0 |
| #N/A | 0 |
| #N/A | 0 |
| #N/A | 0 |
| #N/A | 0 |
| #N/A | 0 |
| #N/A | 0 |
| #N/A | 0 |
| #N/A | 0 |
| #N/A | 0 |
| #N/A | 0 |
| #N/A | 0 |
| #N/A | 0 |
| #N/A | 0 |
| #N/A | 0 |
| #N/A | 0 |
| #N/A | 0 |
| #N/A | 0 |
| #N/A | 0 |
| #N/A | 0 |
| #N/A | 0 |
| #N/A | 0 |
| #N/A | 0 |
| #N/A | 0 |
| #N/A | 0 |
| #N/A | 0 |
| #N/A | 0 |
| #N/A | 0 |
| #N/A | 0 |
| #N/A | 0 |
| #N/A | 0 |
| #N/A | 0 |
| #N/A | 0 |
| #N/A | 0 |
| #N/A | 0 |
| #N/A | 0 |
| #N/A | 0 |
| #N/A | 0 |
| #N/A | 0 |
| #N/A | 0 |
| #N/A | 0 |
| #N/A | 0 |
| #N/A | 0 |
| #N/A | 0 |
| #N/A | 0 |
| #N/A | 0 |
| #N/A | 0 |
| #N/A | 0 |
| #N/A | 0 |
| #N/A | 0 |
| #N/A | 0 |
| #N/A | 0 |
| #N/A | 0 |
| #N/A | 0 |
| #N/A | 0 |
| #N/A | 0 |
| #N/A | 0 |
| #N/A | 0 |
| #N/A | 0 |
| #N/A | 0 |
| #N/A | 0 |
| #N/A | 0 |
| #N/A | 0 |
| #N/A | 0 |
| #N/A | 0 |
| #N/A | 0 |
| #N/A | 0 |
| #N/A | 0 |
| #N/A | 0 |
| #N/A | 0 |
| #N/A | 0 |
| #N/A | 0 |
| #N/A | 0 |
| #N/A | 0 |
| #N/A | 0 |
| #N/A | 0 |
| #N/A | 0 |
| #N/A | 0 |
| #N/A | 0 |
| #N/A | 0 |
| #N/A | 0 |
| #N/A | 0 |
| #N/A | 0 |
| #N/A | 0 |
| #N/A | 0 |
| #N/A | 0 |
| #N/A | 0 |
| #N/A | 0 |
| #N/A | 0 |
| #N/A | 0 |
| #N/A | 0 |
| #N/A | 0 |
| #N/A | 0 |
| #N/A | 0 |
| #N/A | 0 |
| #N/A | 0 |
| #N/A | 0 |
| #N/A | 0 |
| #N/A | 0 |
| #N/A | 0 |
| #N/A | 0 |
| #N/A | 0 |
| #N/A | 0 |
| #N/A | 0 |
| #N/A | 0 |
| #N/A | 0 |
| #N/A | 0 |
| #N/A | 0 |
| #N/A | 0 |
| #N/A | 0 |
| #N/A | 0 |
| #N/A | 0 |
| #N/A | 0 |
| #N/A | 0 |
| #N/A | 0 |
| #N/A | 0 |
| #N/A | 0 |
| #N/A | 0 |
| #N/A | 0 |
| #N/A | 0 |
| #N/A | 0 |
| #N/A | 0 |
| #N/A | 0 |
| #N/A | 0 |
| #N/A | 0 |
| #N/A | 0 |
| #N/A | 0 |
| #N/A | 0 |
| #N/A | 0 |
| #N/A | 0 |
| #N/A | 0 |
| #N/A | 0 |
| #N/A | 0 |
| #N/A | 0 |
| #N/A | 0 |
| #N/A | 0 |
| #N/A | 0 |
| #N/A | 0 |
| #N/A | 0 |
| #N/A | 0 |
| #N/A | 0 |
| #N/A | 0 |
| #N/A | 0 |
| #N/A | 0 |
| #N/A | 0 |
| #N/A | 0 |
| #N/A | 0 |
| #N/A | 0 |
| #N/A | 0 |
| #N/A | 0 |
| #N/A | 0 |
| #N/A | 0 |
| #N/A | 0 |
| #N/A | 0 |
| #N/A | 0 |
| #N/A | 0 |
| #N/A | 0 |
| #N/A | 0 |
| #N/A | 0 |
| #N/A | 0 |
| #N/A | 0 |
| #N/A | 0 |
| #N/A | 0 |
| #N/A | 0 |
| #N/A | 0 |
| #N/A | 0 |
| #N/A | 0 |
| #N/A | 0 |
| #N/A | 0 |
| #N/A | 0 |
| #N/A | 0 |
| #N/A | 0 |
| #N/A | 0 |
| #N/A | 0 |
| #N/A | 0 |
| #N/A | 0 |
| #N/A | 0 |
| #N/A | 0 |
| #N/A | 0 |
| #N/A | 0 |
| #N/A | 0 |
| #N/A | 0 |
| #N/A | 0 |
| #N/A | 0 |
| #N/A | 0 |
| #N/A | 0 |
| #N/A | 0 |
| #N/A | 0 |
| #N/A | 0 |
| #N/A | 0 |
| #N/A | 0 |
| #N/A | 0 |
| #N/A | 0 |
| #N/A | 0 |
| #N/A | 0 |
| #N/A | 0 |
| #N/A | 0 |
| #N/A | 0 |
| #N/A | 0 |
| #N/A | 0 |
| #N/A | 0 |
| #N/A | 0 |
| #N/A | 0 |
| #N/A | 0 |
| #N/A | 0 |
| #N/A | 0 |
| #N/A | 0 |
| #N/A | 0 |
| #N/A | 0 |
| #N/A | 0 |
| #N/A | 0 |
| #N/A | 0 |
| #N/A | 0 |
| #N/A | 0 |
| #N/A | 0 |
| #N/A | 0 |
| #N/A | 0 |
| #N/A | 0 |
| #N/A | 0 |
| #N/A | 0 |
| #N/A | 0 |
| #N/A | 0 |
| #N/A | 0 |
| #N/A | 0 |
| #N/A | 0 |
| #N/A | 0 |
| #N/A | 0 |
| #N/A | 0 |
| #N/A | 0 |
| #N/A | 0 |
| #N/A | 0 |
| #N/A | 0 |
| #N/A | 0 |
| #N/A | 0 |
| #N/A | 0 |
| #N/A | 0 |
| #N/A | 0 |
| #N/A | 0 |
| #N/A | 0 |
| #N/A | 0 |
| #N/A | 0 |
| #N/A | 0 |
| #N/A | 0 |
| #N/A | 0 |
| #N/A | 0 |
| #N/A | 0 |
| #N/A | 0 |
| #N/A | 0 |
| #N/A | 0 |
| #N/A | 0 |
| #N/A | 0 |
| #N/A | 0 |
| #N/A | 0 |
| #N/A | 0 |
| #N/A | 0 |
| #N/A | 0 |
| #N/A | 0 |
| #N/A | 0 |
| #N/A | 0 |
| #N/A | 0 |
| #N/A | 0 |
| #N/A | 0 |
| #N/A | 0 |
| #N/A | 0 |
| #N/A | 0 |
| #N/A | 0 |
| #N/A | 0 |
| #N/A | 0 |
| #N/A | 0 |
| #N/A | 0 |
| #N/A | 0 |
| #N/A | 0 |
| #N/A | 0 |
| #N/A | 0 |
| #N/A | 0 |
| #N/A | 0 |
| #N/A | 0 |
| #N/A | 0 |
| #N/A | 0 |
| #N/A | 0 |
| #N/A | 0 |
| #N/A | 0 |
| #N/A | 0 |
| #N/A | 0 |
| #N/A | 0 |
| #N/A | 0 |
| #N/A | 0 |
| #N/A | 0 |
| #N/A | 0 |
| #N/A | 0 |
| #N/A | 0 |
| #N/A | 0 |
| #N/A | 0 |
| #N/A | 0 |
| #N/A | 0 |
| #N/A | 0 |
| #N/A | 0 |
| #N/A | 0 |
| #N/A | 0 |
| #N/A | 0 |
| #N/A | 0 |
| #N/A | 0 |
| #N/A | 0 |
| #N/A | 0 |
| #N/A | 0 |
| #N/A | 0 |
| #N/A | 0 |
| #N/A | 0 |
| #N/A | 0 |
| #N/A | 0 |
| #N/A | 0 |
| #N/A | 0 |
| #N/A | 0 |
| #N/A | 0 |
| #N/A | 0 |
| #N/A | 0 |
| #N/A | 0 |
| #N/A | 0 |
| #N/A | 0 |
| #N/A | 0 |
| #N/A | 0 |
| #N/A | 0 |
| #N/A | 0 |
| #N/A | 0 |
| #N/A | 0 |
| #N/A | 0 |
| #N/A | 0 |
| #N/A | 0 |
| #N/A | 0 |
| #N/A | 0 |
| #N/A | 0 |
| #N/A | 0 |
| #N/A | 0 |
| #N/A | 0 |
| #N/A | 0 |
| #N/A | 0 |
| #N/A | 0 |
| #N/A | 0 |
| #N/A | 0 |
| #N/A | 0 |
| #N/A | 0 |
| #N/A | 0 |
| #N/A | 0 |
| #N/A | 0 |
| #N/A | 0 |
| #N/A | 0 |
| #N/A | 0 |
| #N/A | 0 |
| #N/A | 0 |
| #N/A | 0 |
| #N/A | 0 |
| #N/A | 0 |
| #N/A | 0 |
| #N/A | 0 |
| #N/A | 0 |
| #N/A | 0 |
| #N/A | 0 |
| #N/A | 0 |
| #N/A | 0 |
| #N/A | 0 |
| #N/A | 0 |
| #N/A | 0 |
| #N/A | 0 |
| #N/A | 0 |
| #N/A | 0 |
| #N/A | 0 |
| #N/A | 0 |
| #N/A | 0 |
| #N/A | 0 |
| #N/A | 0 |
| #N/A | 0 |
| #N/A | 0 |
| #N/A | 0 |
| #N/A | 0 |
| #N/A | 0 |
| #N/A | 0 |
| #N/A | 0 |
| #N/A | 0 |
| #N/A | 0 |
| #N/A | 0 |
| #N/A | 0 |
| #N/A | 0 |
| #N/A | 0 |
| #N/A | 0 |
| #N/A | 0 |
| #N/A | 0 |
| #N/A | 0 |
| #N/A | 0 |
| #N/A | 0 |
| #N/A | 0 |
| #N/A | 0 |
| #N/A | 0 |
| #N/A | 0 |
| #N/A | 0 |
| #N/A | 0 |
| #N/A | 0 |
| #N/A | 0 |
| #N/A | 0 |
| #N/A | 0 |
| #N/A | 0 |
| #N/A | 0 |
| #N/A | 0 |
| #N/A | 0 |
| #N/A | 0 |
| #N/A | 0 |
| #N/A | 0 |
| #N/A | 0 |
| #N/A | 0 |
| #N/A | 0 |
| #N/A | 0 |
| #N/A | 0 |
| #N/A | 0 |
| #N/A | 0 |
| #N/A | 0 |
| #N/A | 0 |
| #N/A | 0 |
| #N/A | 0 |
| #N/A | 0 |
| #N/A | 0 |
| #N/A | 0 |
| #N/A | 0 |
| #N/A | 0 |
| #N/A | 0 |
| #N/A | 0 |
| #N/A | 0 |
| #N/A | 0 |
| #N/A | 0 |
| #N/A | 0 |
| #N/A | 0 |
| #N/A | 0 |
| #N/A | 0 |
| #N/A | 0 |
| #N/A | 0 |
| #N/A | 0 |
| #N/A | 0 |
| #N/A | 0 |
| #N/A | 0 |
| #N/A | 0 |
| #N/A | 0 |
| #N/A | 0 |
| #N/A | 0 |
| #N/A | 0 |
| #N/A | 0 |
| #N/A | 0 |
| #N/A | 0 |
| #N/A | 0 |
| #N/A | 0 |
| #N/A | 0 |
| #N/A | 0 |
| #N/A | 0 |
| #N/A | 0 |
| #N/A | 0 |
| #N/A | 0 |
| #N/A | 0 |
| #N/A | 0 |
| #N/A | 0 |
| #N/A | 0 |
| #N/A | 0 |
| #N/A | 0 |
| #N/A | 0 |
| #N/A | 0 |
| #N/A | 0 |
| #N/A | 0 |
| #N/A | 0 |
| #N/A | 0 |
| #N/A | 0 |
| #N/A | 0 |
| #N/A | 0 |
| #N/A | 0 |
| #N/A | 0 |
| #N/A | 0 |
| #N/A | 0 |
| #N/A | 0 |
| #N/A | 0 |
| #N/A | 0 |
| #N/A | 0 |
| #N/A | 0 |
| #N/A | 0 |
| #N/A | 0 |
| #N/A | 0 |
| #N/A | 0 |
| #N/A | 0 |
| #N/A | 0 |
| #N/A | 0 |
| #N/A | 0 |
| #N/A | 0 |
| #N/A | 0 |
| #N/A | 0 |
| #N/A | 0 |
| #N/A | 0 |
| #N/A | 0 |
| #N/A | 0 |
| #N/A | 0 |
| #N/A | 0 |
| #N/A | 0 |
| #N/A | 0 |
| #N/A | 0 |
| #N/A | 0 |
| #N/A | 0 |
| #N/A | 0 |
| #N/A | 0 |
| #N/A | 0 |
| #N/A | 0 |
| #N/A | 0 |
| #N/A | 0 |
| #N/A | 0 |
| #N/A | 0 |
| #N/A | 0 |
| #N/A | 0 |
| #N/A | 0 |
| #N/A | 0 |
| #N/A | 0 |
| #N/A | 0 |
| #N/A | 0 |
| #N/A | 0 |
| #N/A | 0 |
| #N/A | 0 |
| #N/A | 0 |
| #N/A | 0 |
| #N/A | 0 |
| #N/A | 0 |
| #N/A | 0 |
| #N/A | 0 |
| #N/A | 0 |
| #N/A | 0 |
| #N/A | 0 |
| #N/A | 0 |
| #N/A | 0 |
| #N/A | 0 |
| #N/A | 0 |
| #N/A | 0 |
| #N/A | 0 |
| #N/A | 0 |
| #N/A | 0 |
| #N/A | 0 |
| #N/A | 0 |
| #N/A | 0 |
| #N/A | 0 |
| #N/A | 0 |
| #N/A | 0 |
| #N/A | 0 |
| #N/A | 0 |
| #N/A | 0 |
| #N/A | 0 |
| #N/A | 0 |
| #N/A | 0 |
| #N/A | 0 |
| #N/A | 0 |
| #N/A | 0 |
| #N/A | 0 |
| #N/A | 0 |
| #N/A | 0 |
| #N/A | 0 |
| #N/A | 0 |
| #N/A | 0 |
| #N/A | 0 |
| #N/A | 0 |
| #N/A | 0 |
| #N/A | 0 |
| #N/A | 0 |
| #N/A | 0 |
| #N/A | 0 |
| #N/A | 0 |
| #N/A | 0 |
| #N/A | 0 |
| #N/A | 0 |
| #N/A | 0 |
| #N/A | 0 |
| #N/A | 0 |
| #N/A | 0 |
| #N/A | 0 |
| #N/A | 0 |
| #N/A | 0 |
| #N/A | 0 |
| #N/A | 0 |
| #N/A | 0 |
| #N/A | 0 |
| #N/A | 0 |
| #N/A | 0 |
| #N/A | 0 |
| #N/A | 0 |
| #N/A | 0 |
| #N/A | 0 |
| #N/A | 0 |
| #N/A | 0 |
| #N/A | 0 |
| #N/A | 0 |
| #N/A | 0 |
| #N/A | 0 |
| #N/A | 0 |
| #N/A | 0 |
| #N/A | 0 |
| #N/A | 0 |
| #N/A | 0 |
| #N/A | 0 |
| #N/A | 0 |
| #N/A | 0 |
| #N/A | 0 |
| #N/A | 0 |
| #N/A | 0 |
| #N/A | 0 |
| #N/A | 0 |
| #N/A | 0 |
| #N/A | 0 |
| #N/A | 0 |
| #N/A | 0 |
| #N/A | 0 |
| #N/A | 0 |
| #N/A | 0 |
| #N/A | 0 |
| #N/A | 0 |
| #N/A | 0 |
| #N/A | 0 |
| #N/A | 0 |
| #N/A | 0 |
| #N/A | 0 |
| #N/A | 0 |
| #N/A | 0 |
| #N/A | 0 |
| #N/A | 0 |
| #N/A | 0 |
| #N/A | 0 |
| #N/A | 0 |
| #N/A | 0 |
| #N/A | 0 |
| #N/A | 0 |
| #N/A | 0 |
| #N/A | 0 |
| #N/A | 0 |
| #N/A | 0 |
| #N/A | 0 |
| #N/A | 0 |
| #N/A | 0 |
| #N/A | 0 |
| #N/A | 0 |
| #N/A | 0 |
| #N/A | 0 |
| #N/A | 0 |
| #N/A | 0 |
| #N/A | 0 |
| #N/A | 0 |
| #N/A | 0 |
| #N/A | 0 |
| #N/A | 0 |
| #N/A | 0 |
| #N/A | 0 |
| #N/A | 0 |
| #N/A | 0 |
| #N/A | 0 |
| #N/A | 0 |
| #N/A | 0 |
| #N/A | 0 |
| #N/A | 0 |
| #N/A | 0 |
| #N/A | 0 |
| #N/A | 0 |
| #N/A | 0 |
| #N/A | 0 |
| #N/A | 0 |
| #N/A | 0 |
| #N/A | 0 |
| #N/A | 0 |
| #N/A | 0 |
| #N/A | 0 |
| #N/A | 0 |
| #N/A | 0 |
| #N/A | 0 |
| #N/A | 0 |
| #N/A | 0 |
| #N/A | 0 |
| #N/A | 0 |
| #N/A | 0 |
| #N/A | 0 |
| #N/A | 0 |
| #N/A | 0 |
| #N/A | 0 |
| #N/A | 0 |
| #N/A | 0 |
| #N/A | 0 |
| #N/A | 0 |
| #N/A | 0 |
| #N/A | 0 |
| #N/A | 0 |
| #N/A | 0 |
| #N/A | 0 |
| #N/A | 0 |
| #N/A | 0 |
| #N/A | 0 |
| #N/A | 0 |
| #N/A | 0 |
| #N/A | 0 |
| #N/A | 0 |
| #N/A | 0 |
| #N/A | 0 |
| #N/A | 0 |
| #N/A | 0 |
| #N/A | 0 |
| #N/A | 0 |
| #N/A | 0 |
| #N/A | 0 |
| #N/A | 0 |
| #N/A | 0 |
| #N/A | 0 |
| #N/A | 0 |
| #N/A | 0 |
| #N/A | 0 |
| #N/A | 0 |
| #N/A | 0 |
| #N/A | 0 |
| #N/A | 0 |
| #N/A | 0 |
| #N/A | 0 |
| #N/A | 0 |
| #N/A | 0 |
| #N/A | 0 |
| #N/A | 0 |
| #N/A | 0 |
| #N/A | 0 |
| #N/A | 0 |
| #N/A | 0 |
| #N/A | 0 |
| #N/A | 0 |
| #N/A | 0 |
| #N/A | 0 |
| #N/A | 0 |
| #N/A | 0 |
| #N/A | 0 |
| #N/A | 0 |
| #N/A | 0 |
| #N/A | 0 |
| #N/A | 0 |
| #N/A | 0 |
| #N/A | 0 |
| #N/A | 0 |
| #N/A | 0 |
| #N/A | 0 |
| #N/A | 0 |
| #N/A | 0 |
| #N/A | 0 |
| #N/A | 0 |
| #N/A | 0 |
| #N/A | 0 |
| #N/A | 0 |
| #N/A | 0 |
| #N/A | 0 |
| #N/A | 0 |
| #N/A | 0 |
| #N/A | 0 |
| #N/A | 0 |
| #N/A | 0 |
| #N/A | 0 |
| #N/A | 0 |
| #N/A | 0 |
| #N/A | 0 |
| #N/A | 0 |
| #N/A | 0 |
| #N/A | 0 |
| #N/A | 0 |
| #N/A | 0 |
| #N/A | 0 |
| #N/A | 0 |
| #N/A | 0 |
| #N/A | 0 |
| #N/A | 0 |
| #N/A | 0 |
| #N/A | 0 |
| #N/A | 0 |
| #N/A | 0 |
| #N/A | 0 |
| #N/A | 0 |
| #N/A | 0 |
| #N/A | 0 |
| #N/A | 0 |
| #N/A | 0 |
| #N/A | 0 |
| #N/A | 0 |
| #N/A | 0 |
| #N/A | 0 |
| #N/A | 0 |
| #N/A | 0 |
| #N/A | 0 |
| #N/A | 0 |
| #N/A | 0 |
| #N/A | 0 |
| #N/A | 0 |
| #N/A | 0 |
| #N/A | 0 |
| #N/A | 0 |
| #N/A | 0 |
| #N/A | 0 |
| #N/A | 0 |
| #N/A | 0 |
| #N/A | 0 |
| #N/A | 0 |
| #N/A | 0 |
| #N/A | 0 |
| #N/A | 0 |
| #N/A | 0 |
| #N/A | 0 |
| #N/A | 0 |
| #N/A | 0 |
| #N/A | 0 |
| #N/A | 0 |
| #N/A | 0 |
| #N/A | 0 |
| #N/A | 0 |
| #N/A | 0 |
| #N/A | 0 |
| #N/A | 0 |
| #N/A | 0 |
| #N/A | 0 |
| #N/A | 0 |
| #N/A | 0 |
| #N/A | 0 |
| #N/A | 0 |
| #N/A | 0 |
| #N/A | 0 |
| #N/A | 0 |
| #N/A | 0 |
| #N/A | 0 |
| #N/A | 0 |
| #N/A | 0 |
| #N/A | 0 |
| #N/A | 0 |
| #N/A | 0 |
| #N/A | 0 |
| #N/A | 0 |
| #N/A | 0 |
| #N/A | 0 |
| #N/A | 0 |
| #N/A | 0 |
| #N/A | 0 |
| #N/A | 0 |
| #N/A | 0 |
| #N/A | 0 |
| #N/A | 0 |
| #N/A | 0 |
| #N/A | 0 |
| #N/A | 0 |
| #N/A | 0 |
| #N/A | 0 |
| #N/A | 0 |
| #N/A | 0 |
| #N/A | 0 |
| #N/A | 0 |
| #N/A | 0 |
| #N/A | 0 |
| #N/A | 0 |
| #N/A | 0 |
| #N/A | 0 |
| #N/A | 0 |
| #N/A | 0 |
| #N/A | 0 |
| #N/A | 0 |
| #N/A | 0 |
| #N/A | 0 |
| #N/A | 0 |
| #N/A | 0 |
| #N/A | 0 |
| #N/A | 0 |
| #N/A | 0 |
| #N/A | 0 |
| #N/A | 0 |
| #N/A | 0 |
| #N/A | 0 |
| #N/A | 0 |
| #N/A | 0 |
| #N/A | 0 |
| #N/A | 0 |
| #N/A | 0 |
| #N/A | 0 |
| #N/A | 0 |
| #N/A | 0 |
| #N/A | 0 |
| #N/A | 0 |
| #N/A | 0 |
| #N/A | 0 |
| #N/A | 0 |
| #N/A | 0 |
| #N/A | 0 |
| #N/A | 0 |
| #N/A | 0 |
| #N/A | 0 |
| #N/A | 0 |
| #N/A | 0 |
| #N/A | 0 |
| #N/A | 0 |
| #N/A | 0 |
| #N/A | 0 |
| #N/A | 0 |
| #N/A | 0 |
| #N/A | 0 |
| #N/A | 0 |
| #N/A | 0 |
| #N/A | 0 |
| #N/A | 0 |
| #N/A | 0 |
| #N/A | 0 |
| #N/A | 0 |
| #N/A | 0 |
| #N/A | 0 |
| #N/A | 0 |
| #N/A | 0 |
| #N/A | 0 |
| #N/A | 0 |
| #N/A | 0 |
| #N/A | 0 |
| #N/A | 0 |
| #N/A | 0 |
| #N/A | 0 |
| #N/A | 0 |
| #N/A | 0 |
| #N/A | 0 |
| #N/A | 0 |
| #N/A | 0 |
| #N/A | 0 |
| #N/A | 0 |
| #N/A | 0 |
| #N/A | 0 |
| #N/A | 0 |
| #N/A | 0 |
| #N/A | 0 |
| #N/A | 0 |
| #N/A | 0 |
| #N/A | 0 |
| #N/A | 0 |
| #N/A | 0 |
| #N/A | 0 |
| #N/A | 0 |
| #N/A | 0 |
| #N/A | 0 |
| #N/A | 0 |
| #N/A | 0 |
| #N/A | 0 |
| #N/A | 0 |
| #N/A | 0 |
| #N/A | 0 |
| #N/A | 0 |
| #N/A | 0 |
| #N/A | 0 |
| #N/A | 0 |
| #N/A | 0 |
| #N/A | 0 |
| #N/A | 0 |
| #N/A | 0 |
| #N/A | 0 |
| #N/A | 0 |
| #N/A | 0 |
| #N/A | 0 |
| #N/A | 0 |
| #N/A | 0 |
| #N/A | 0 |
| #N/A | 0 |
| #N/A | 0 |
| #N/A | 0 |
| #N/A | 0 |
| #N/A | 0 |
| #N/A | 0 |
| #N/A | 0 |
| #N/A | 0 |
| #N/A | 0 |
| #N/A | 0 |
| #N/A | 0 |
| #N/A | 0 |
| #N/A | 0 |
| #N/A | 0 |
| #N/A | 0 |
| #N/A | 0 |
| #N/A | 0 |
| #N/A | 0 |
| #N/A | 0 |
| #N/A | 0 |
| #N/A | 0 |
| #N/A | 0 |
| #N/A | 0 |
| #N/A | 0 |
| #N/A | 0 |
| #N/A | 0 |
| #N/A | 0 |
| #N/A | 0 |
| #N/A | 0 |
| #N/A | 0 |
| #N/A | 0 |
| #N/A | 0 |
| #N/A | 0 |
| #N/A | 0 |
| #N/A | 0 |
| #N/A | 0 |
| #N/A | 0 |
| #N/A | 0 |
| #N/A | 0 |
| #N/A | 0 |
| #N/A | 0 |
| #N/A | 0 |
| #N/A | 0 |
| #N/A | 0 |
| #N/A | 0 |
| #N/A | 0 |
| #N/A | 0 |
| #N/A | 0 |
| #N/A | 0 |
| #N/A | 0 |
| #N/A | 0 |
| #N/A | 0 |
| #N/A | 0 |
| #N/A | 0 |
| #N/A | 0 |
| #N/A | 0 |
| #N/A | 0 |
| #N/A | 0 |
| #N/A | 0 |
| #N/A | 0 |
| #N/A | 0 |
| #N/A | 0 |
| #N/A | 0 |
| #N/A | 0 |
| #N/A | 0 |
| #N/A | 0 |
| #N/A | 0 |
| #N/A | 0 |
| #N/A | 0 |
| #N/A | 0 |
| #N/A | 0 |
| #N/A | 0 |
| #N/A | 0 |
| #N/A | 0 |
| #N/A | 0 |
| #N/A | 0 |
| #N/A | 0 |
| #N/A | 0 |
| #N/A | 0 |
| #N/A | 0 |
| #N/A | 0 |
| #N/A | 0 |
| #N/A | 0 |
| #N/A | 0 |
| #N/A | 0 |
| #N/A | 0 |
| #N/A | 0 |
| #N/A | 0 |
| #N/A | 0 |
| #N/A | 0 |
| #N/A | 0 |
| #N/A | 0 |
| #N/A | 0 |
| #N/A | 0 |
| #N/A | 0 |
| #N/A | 0 |
| #N/A | 0 |
| #N/A | 0 |
| #N/A | 0 |
| #N/A | 0 |
| #N/A | 0 |
| #N/A | 0 |
| #N/A | 0 |
| #N/A | 0 |
| #N/A | 0 |
| #N/A | 0 |
| #N/A | 0 |
| #N/A | 0 |
| #N/A | 0 |
| #N/A | 0 |
| #N/A | 0 |
| #N/A | 0 |
| #N/A | 0 |
| #N/A | 0 |
| #N/A | 0 |
| #N/A | 0 |
| #N/A | 0 |
| #N/A | 0 |
| #N/A | 0 |
| #N/A | 0 |
| #N/A | 0 |
| #N/A | 0 |
| #N/A | 0 |
| #N/A | 0 |
| #N/A | 0 |
| #N/A | 0 |
| #N/A | 0 |
| #N/A | 0 |
| #N/A | 0 |
| #N/A | 0 |
| #N/A | 0 |
| #N/A | 0 |
| #N/A | 0 |
| #N/A | 0 |
| #N/A | 0 |
| #N/A | 0 |
| #N/A | 0 |
| #N/A | 0 |
| #N/A | 0 |
| #N/A | 0 |
| #N/A | 0 |
| #N/A | 0 |
| #N/A | 0 |
| #N/A | 0 |
| #N/A | 0 |
| #N/A | 0 |
| #N/A | 0 |
| #N/A | 0 |
| #N/A | 0 |
| #N/A | 0 |
| #N/A | 0 |
| #N/A | 0 |
| #N/A | 0 |
| #N/A | 0 |
| #N/A | 0 |
| #N/A | 0 |
| #N/A | 0 |
| #N/A | 0 |
| #N/A | 0 |
| #N/A | 0 |
| #N/A | 0 |
| #N/A | 0 |
| #N/A | 0 |
| #N/A | 0 |
| #N/A | 0 |
| #N/A | 0 |
| #N/A | 0 |
| #N/A | 0 |
| #N/A | 0 |
| #N/A | 0 |
| #N/A | 0 |
| #N/A | 0 |
| #N/A | 0 |
| #N/A | 0 |
| #N/A | 0 |
| #N/A | 0 |
| #N/A | 0 |
| #N/A | 0 |
| #N/A | 0 |
| #N/A | 0 |
| #N/A | 0 |
| #N/A | 0 |
| #N/A | 0 |
| #N/A | 0 |
| #N/A | 0 |
| #N/A | 0 |
| #N/A | 0 |
| #N/A | 0 |
| #N/A | 0 |
| #N/A | 0 |
| #N/A | 0 |
| #N/A | 0 |
| #N/A | 0 |
| #N/A | 0 |
| #N/A | 0 |
| #N/A | 0 |
| #N/A | 0 |
| #N/A | 0 |
| #N/A | 0 |
| #N/A | 0 |
| #N/A | 0 |
| #N/A | 0 |
| #N/A | 0 |
| #N/A | 0 |
| #N/A | 0 |
| #N/A | 0 |
| #N/A | 0 |
| #N/A | 0 |
| #N/A | 0 |
| #N/A | 0 |
| #N/A | 0 |
| #N/A | 0 |
| #N/A | 0 |
| #N/A | 0 |
| #N/A | 0 |
| #N/A | 0 |
| #N/A | 0 |
| #N/A | 0 |
| #N/A | 0 |
| #N/A | 0 |
| #N/A | 0 |
| #N/A | 0 |
| #N/A | 0 |
| #N/A | 0 |
| #N/A | 0 |
| #N/A | 0 |
| #N/A | 0 |
| #N/A | 0 |
| #N/A | 0 |
| #N/A | 0 |
| #N/A | 0 |
| #N/A | 0 |
| #N/A | 0 |
| #N/A | 0 |
| #N/A | 0 |
| #N/A | 0 |
| #N/A | 0 |
| #N/A | 0 |
| #N/A | 0 |
| #N/A | 0 |
| #N/A | 0 |
| #N/A | 0 |
| #N/A | 0 |
| #N/A | 0 |
| #N/A | 0 |
| #N/A | 0 |
| #N/A | 0 |
| #N/A | 0 |
| #N/A | 0 |
| #N/A | 0 |
| #N/A | 0 |
| #N/A | 0 |
| #N/A | 0 |
| #N/A | 0 |
| #N/A | 0 |
| #N/A | 0 |
| #N/A | 0 |
| #N/A | 0 |
| #N/A | 0 |
| #N/A | 0 |
| #N/A | 0 |
| #N/A | 0 |
| #N/A | 0 |
| #N/A | 0 |
| #N/A | 0 |
| #N/A | 0 |
| #N/A | 0 |
| #N/A | 0 |
| #N/A | 0 |
| #N/A | 0 |
| #N/A | 0 |
| #N/A | 0 |
| #N/A | 0 |
| #N/A | 0 |
| #N/A | 0 |
| #N/A | 0 |
| #N/A | 0 |
| #N/A | 0 |
| #N/A | 0 |
| #N/A | 0 |
| #N/A | 0 |
| #N/A | 0 |
| #N/A | 0 |
| #N/A | 0 |
| #N/A | 0 |
| #N/A | 0 |
| #N/A | 0 |
| #N/A | 0 |
| #N/A | 0 |
| #N/A | 0 |
| #N/A | 0 |
| #N/A | 0 |
| #N/A | 0 |
| #N/A | 0 |
| #N/A | 0 |
| #N/A | 0 |
| #N/A | 0 |
| #N/A | 0 |
| #N/A | 0 |
| #N/A | 0 |
| #N/A | 0 |
| #N/A | 0 |
| #N/A | 0 |
| #N/A | 0 |
| #N/A | 0 |
| #N/A | 0 |
| #N/A | 0 |
| #N/A | 0 |
| #N/A | 0 |
| #N/A | 0 |
| #N/A | 0 |
| #N/A | 0 |
| #N/A | 0 |
| #N/A | 0 |
| #N/A | 0 |
| #N/A | 0 |
| #N/A | 0 |
| #N/A | 0 |
| #N/A | 0 |
| #N/A | 0 |
| #N/A | 0 |
| #N/A | 0 |
| #N/A | 0 |
| #N/A | 0 |
| #N/A | 0 |
| #N/A | 0 |
| #N/A | 0 |
| #N/A | 0 |
| #N/A | 0 |
| #N/A | 0 |
| #N/A | 0 |
| #N/A | 0 |
| #N/A | 0 |
| #N/A | 0 |
| #N/A | 0 |
| #N/A | 0 |
| #N/A | 0 |
| #N/A | 0 |
| #N/A | 0 |
| #N/A | 0 |
| #N/A | 0 |
| #N/A | 0 |
| #N/A | 0 |
| #N/A | 0 |
| #N/A | 0 |
| #N/A | 0 |
| #N/A | 0 |
| #N/A | 0 |
| #N/A | 0 |
| #N/A | 0 |
| #N/A | 0 |
| #N/A | 0 |
| #N/A | 0 |
| #N/A | 0 |
| #N/A | 0 |
| #N/A | 0 |
| #N/A | 0 |
| #N/A | 0 |
| #N/A | 0 |
| #N/A | 0 |
| #N/A | 0 |
| #N/A | 0 |
| #N/A | 0 |
| #N/A | 0 |
| #N/A | 0 |
| #N/A | 0 |
| #N/A | 0 |
| #N/A | 0 |
| #N/A | 0 |
| #N/A | 0 |
| #N/A | 0 |
| #N/A | 0 |
| #N/A | 0 |
| #N/A | 0 |
| #N/A | 0 |
| #N/A | 0 |
| #N/A | 0 |
| #N/A | 0 |
| #N/A | 0 |
| #N/A | 0 |
| #N/A | 0 |
| #N/A | 0 |
| #N/A | 0 |
| #N/A | 0 |
| #N/A | 0 |
| #N/A | 0 |
| #N/A | 0 |
| #N/A | 0 |
| #N/A | 0 |
| #N/A | 0 |
| #N/A | 0 |
| #N/A | 0 |
| #N/A | 0 |
| #N/A | 0 |
| #N/A | 0 |
| #N/A | 0 |
| #N/A | 0 |
| #N/A | 0 |
| #N/A | 0 |
| #N/A | 0 |
| #N/A | 0 |
| #N/A | 0 |
| #N/A | 0 |
| #N/A | 0 |
| #N/A | 0 |
| #N/A | 0 |
| #N/A | 0 |
| #N/A | 0 |
| #N/A | 0 |
| #N/A | 0 |
| #N/A | 0 |
| #N/A | 0 |
| #N/A | 0 |
| #N/A | 0 |
| #N/A | 0 |
| #N/A | 0 |
| #N/A | 0 |
| #N/A | 0 |
| #N/A | 0 |
| #N/A | 0 |
| #N/A | 0 |
| #N/A | 0 |
| #N/A | 0 |
| #N/A | 0 |
| #N/A | 0 |
| #N/A | 0 |
| #N/A | 0 |
| #N/A | 0 |
| #N/A | 0 |
| #N/A | 0 |
| #N/A | 0 |
| #N/A | 0 |
| #N/A | 0 |
| #N/A | 0 |
| #N/A | 0 |
| #N/A | 0 |
| #N/A | 0 |
| #N/A | 0 |
| #N/A | 0 |
| #N/A | 0 |
| #N/A | 0 |
| #N/A | 0 |
| #N/A | 0 |
| #N/A | 0 |
| #N/A | 0 |
| #N/A | 0 |
| #N/A | 0 |
| #N/A | 0 |
| #N/A | 0 |
| #N/A | 0 |
| #N/A | 0 |
| #N/A | 0 |
| #N/A | 0 |
| #N/A | 0 |
| #N/A | 0 |
| #N/A | 0 |
| #N/A | 0 |
| #N/A | 0 |
| #N/A | 0 |
| #N/A | 0 |
| #N/A | 0 |
| #N/A | 0 |
| #N/A | 0 |
| #N/A | 0 |
| #N/A | 0 |
| #N/A | 0 |
| #N/A | 0 |
| #N/A | 0 |
| #N/A | 0 |
| #N/A | 0 |
| #N/A | 0 |
| #N/A | 0 |
| #N/A | 0 |
| #N/A | 0 |
| #N/A | 0 |
| #N/A | 0 |
| #N/A | 0 |
| #N/A | 0 |
| #N/A | 0 |
| #N/A | 0 |
| #N/A | 0 |
| #N/A | 0 |
| #N/A | 0 |
| #N/A | 0 |
| #N/A | 0 |
| #N/A | 0 |
| #N/A | 0 |
| #N/A | 0 |
| #N/A | 0 |
| #N/A | 0 |
| #N/A | 0 |
| #N/A | 0 |
| #N/A | 0 |
| #N/A | 0 |
| #N/A | 0 |
| #N/A | 0 |
| #N/A | 0 |
| #N/A | 0 |
| #N/A | 0 |
| #N/A | 0 |
| #N/A | 0 |
| #N/A | 0 |
| #N/A | 0 |
| #N/A | 0 |
| #N/A | 0 |
| #N/A | 0 |
| #N/A | 0 |
| #N/A | 0 |
| #N/A | 0 |
| #N/A | 0 |
| #N/A | 0 |
| #N/A | 0 |
| #N/A | 0 |
| #N/A | 0 |
| #N/A | 0 |
| #N/A | 0 |
| #N/A | 0 |
| #N/A | 0 |
| #N/A | 0 |
| #N/A | 0 |
| #N/A | 0 |
| #N/A | 0 |
| #N/A | 0 |
| #N/A | 0 |
| #N/A | 0 |
| #N/A | 0 |
| #N/A | 0 |
| #N/A | 0 |
| #N/A | 0 |
| #N/A | 0 |
| #N/A | 0 |
| #N/A | 0 |
| #N/A | 0 |
| #N/A | 0 |
| #N/A | 0 |
| #N/A | 0 |
| #N/A | 0 |
| #N/A | 0 |
| #N/A | 0 |
| #N/A | 0 |
| #N/A | 0 |
| #N/A | 0 |
| #N/A | 0 |
| #N/A | 0 |
| #N/A | 0 |
| #N/A | 0 |
| #N/A | 0 |
| #N/A | 0 |
| #N/A | 0 |
| #N/A | 0 |
| #N/A | 0 |
| #N/A | 0 |
| #N/A | 0 |
| #N/A | 0 |
| #N/A | 0 |
| #N/A | 0 |
| #N/A | 0 |
| #N/A | 0 |
| #N/A | 0 |
| #N/A | 0 |
| #N/A | 0 |
| #N/A | 0 |
| #N/A | 0 |
| #N/A | 0 |
| #N/A | 0 |
| #N/A | 0 |
| #N/A | 0 |
| #N/A | 0 |
| #N/A | 0 |
| #N/A | 0 |
| #N/A | 0 |
| #N/A | 0 |
| #N/A | 0 |
| #N/A | 0 |
| #N/A | 0 |
| #N/A | 0 |
| #N/A | 0 |
| #N/A | 0 |
| #N/A | 0 |
| #N/A | 0 |
| #N/A | 0 |
| #N/A | 0 |
| #N/A | 0 |
| #N/A | 0 |
| #N/A | 0 |
| #N/A | 0 |
| #N/A | 0 |
| #N/A | 0 |
| #N/A | 0 |
| #N/A | 0 |
| #N/A | 0 |
| #N/A | 0 |
| #N/A | 0 |
| #N/A | 0 |
| #N/A | 0 |
| #N/A | 0 |
| #N/A | 0 |
| #N/A | 0 |
| #N/A | 0 |
| #N/A | 0 |
| #N/A | 0 |
| #N/A | 0 |
| #N/A | 0 |
| #N/A | 0 |
| #N/A | 0 |
| #N/A | 0 |
| #N/A | 0 |
| #N/A | 0 |
| #N/A | 0 |
| #N/A | 0 |
| #N/A | 0 |
| #N/A | 0 |
| #N/A | 0 |
| #N/A | 0 |
| #N/A | 0 |
| #N/A | 0 |
| #N/A | 0 |
| #N/A | 0 |
| #N/A | 0 |
| #N/A | 0 |
| #N/A | 0 |
| #N/A | 0 |
| #N/A | 0 |
| #N/A | 0 |
| #N/A | 0 |
| #N/A | 0 |
| #N/A | 0 |
| #N/A | 0 |
| #N/A | 0 |
| #N/A | 0 |
| #N/A | 0 |
| #N/A | 0 |
| #N/A | 0 |
| #N/A | 0 |
| #N/A | 0 |
| #N/A | 0 |
| #N/A | 0 |
| #N/A | 0 |
| #N/A | 0 |
| #N/A | 0 |
| #N/A | 0 |
| #N/A | 0 |
| #N/A | 0 |
| #N/A | 0 |
| #N/A | 0 |
| #N/A | 0 |
| #N/A | 0 |
| #N/A | 0 |
| #N/A | 0 |
| #N/A | 0 |
| #N/A | 0 |
| #N/A | 0 |
| #N/A | 0 |
| #N/A | 0 |
| #N/A | 0 |
| #N/A | 0 |
| #N/A | 0 |
| #N/A | 0 |
| #N/A | 0 |
| #N/A | 0 |
| #N/A | 0 |
| #N/A | 0 |
| #N/A | 0 |
| #N/A | 0 |
| #N/A | 0 |
| #N/A | 0 |
| #N/A | 0 |
| #N/A | 0 |
| #N/A | 0 |
| #N/A | 0 |
| #N/A | 0 |
| #N/A | 0 |
| #N/A | 0 |
| #N/A | 0 |
| #N/A | 0 |
| #N/A | 0 |
| #N/A | 0 |
| #N/A | 0 |
| #N/A | 0 |
| #N/A | 0 |
| #N/A | 0 |
| #N/A | 0 |
| #N/A | 0 |
| #N/A | 0 |
| #N/A | 0 |
| #N/A | 0 |
| #N/A | 0 |
| #N/A | 0 |
| #N/A | 0 |
| #N/A | 0 |
| #N/A | 0 |
| #N/A | 0 |
| #N/A | 0 |
| #N/A | 0 |
| #N/A | 0 |
| #N/A | 0 |
| #N/A | 0 |
| #N/A | 0 |
| #N/A | 0 |
| #N/A | 0 |
| #N/A | 0 |
| #N/A | 0 |
| #N/A | 0 |
| #N/A | 0 |
| #N/A | 0 |
| #N/A | 0 |
| #N/A | 0 |
| #N/A | 0 |
| #N/A | 0 |
| #N/A | 0 |
| #N/A | 0 |
| #N/A | 0 |
| #N/A | 0 |
| #N/A | 0 |
| #N/A | 0 |
| #N/A | 0 |
| #N/A | 0 |
| #N/A | 0 |
| #N/A | 0 |
| #N/A | 0 |
| #N/A | 0 |
| #N/A | 0 |
| #N/A | 0 |
| #N/A | 0 |
| #N/A | 0 |
| #N/A | 0 |
| #N/A | 0 |
| #N/A | 0 |
| #N/A | 0 |
| #N/A | 0 |
| #N/A | 0 |
| #N/A | 0 |
| #N/A | 0 |
| #N/A | 0 |
| #N/A | 0 |
| #N/A | 0 |
| #N/A | 0 |
| #N/A | 0 |
| #N/A | 0 |
| #N/A | 0 |
| #N/A | 0 |
| #N/A | 0 |
| #N/A | 0 |
| #N/A | 0 |
| #N/A | 0 |
| #N/A | 0 |
| #N/A | 0 |
| #N/A | 0 |
| #N/A | 0 |
| #N/A | 0 |
| #N/A | 0 |
| #N/A | 0 |
| #N/A | 0 |
| #N/A | 0 |
| #N/A | 0 |
| #N/A | 0 |
| #N/A | 0 |
| #N/A | 0 |
| #N/A | 0 |
| #N/A | 0 |
| #N/A | 0 |
| #N/A | 0 |
| #N/A | 0 |
| #N/A | 0 |
| #N/A | 0 |
| #N/A | 0 |
| #N/A | 0 |
| #N/A | 0 |
| #N/A | 0 |
| #N/A | 0 |
| #N/A | 0 |
| #N/A | 0 |
| #N/A | 0 |
| #N/A | 0 |
| #N/A | 0 |
| #N/A | 0 |
| #N/A | 0 |
| #N/A | 0 |
| #N/A | 0 |
| #N/A | 0 |
| #N/A | 0 |
| #N/A | 0 |
| #N/A | 0 |
| #N/A | 0 |
| #N/A | 0 |
| #N/A | 0 |
| #N/A | 0 |
| #N/A | 0 |
| #N/A | 0 |
| #N/A | 0 |
| #N/A | 0 |
| #N/A | 0 |
| #N/A | 0 |
| #N/A | 0 |
| #N/A | 0 |
| #N/A | 0 |
| #N/A | 0 |
| #N/A | 0 |
| #N/A | 0 |
| #N/A | 0 |
| #N/A | 0 |
| #N/A | 0 |
| #N/A | 0 |
| #N/A | 0 |
| #N/A | 0 |
| #N/A | 0 |
| #N/A | 0 |
| #N/A | 0 |
| #N/A | 0 |
| #N/A | 0 |
| #N/A | 0 |
| #N/A | 0 |
| #N/A | 0 |
| #N/A | 0 |
| #N/A | 0 |
| #N/A | 0 |
| #N/A | 0 |
| #N/A | 0 |
| #N/A | 0 |
| #N/A | 0 |
| #N/A | 0 |
| #N/A | 0 |
| #N/A | 0 |
| #N/A | 0 |
| #N/A | 0 |
| #N/A | 0 |
| #N/A | 0 |
| #N/A | 0 |
| #N/A | 0 |
| #N/A | 0 |
| #N/A | 0 |
| #N/A | 0 |
| #N/A | 0 |
| #N/A | 0 |
| #N/A | 0 |
| #N/A | 0 |
| #N/A | 0 |
| #N/A | 0 |
| #N/A | 0 |
| #N/A | 0 |
| #N/A | 0 |
| #N/A | 0 |
| #N/A | 0 |
| #N/A | 0 |
| #N/A | 0 |
| #N/A | 0 |
| #N/A | 0 |
| #N/A | 0 |
| #N/A | 0 |
| #N/A | 0 |
| #N/A | 0 |
| #N/A | 0 |
| #N/A | 0 |
| #N/A | 0 |
| #N/A | 0 |
| #N/A | 0 |
| #N/A | 0 |
| #N/A | 0 |
| #N/A | 0 |
| #N/A | 0 |
| #N/A | 0 |
| #N/A | 0 |
| #N/A | 0 |
| #N/A | 0 |
| #N/A | 0 |
| #N/A | 0 |
| #N/A | 0 |
| #N/A | 0 |
| #N/A | 0 |
| #N/A | 0 |
| #N/A | 0 |
| #N/A | 0 |
| #N/A | 0 |
| #N/A | 0 |
| #N/A | 0 |
| #N/A | 0 |
| #N/A | 0 |
| #N/A | 0 |
| #N/A | 0 |
| #N/A | 0 |
| #N/A | 0 |
| #N/A | 0 |
| #N/A | 0 |
| #N/A | 0 |
| #N/A | 0 |
| #N/A | 0 |
| #N/A | 0 |
| #N/A | 0 |
| #N/A | 0 |
| #N/A | 0 |
| #N/A | 0 |
| #N/A | 0 |
| #N/A | 0 |
| #N/A | 0 |
| #N/A | 0 |
| #N/A | 0 |
| #N/A | 0 |
| #N/A | 0 |
| #N/A | 0 |
| #N/A | 0 |
| #N/A | 0 |
| #N/A | 0 |
| #N/A | 0 |
| #N/A | 0 |
| #N/A | 0 |
| #N/A | 0 |
| #N/A | 0 |
| #N/A | 0 |
| #N/A | 0 |
| #N/A | 0 |
| #N/A | 0 |
| #N/A | 0 |
| #N/A | 0 |
| #N/A | 0 |
| #N/A | 0 |
| #N/A | 0 |
| #N/A | 0 |
| #N/A | 0 |
| #N/A | 0 |
| #N/A | 0 |
| #N/A | 0 |
| #N/A | 0 |
| #N/A | 0 |
| #N/A | 0 |
| #N/A | 0 |
| #N/A | 0 |
| #N/A | 0 |
| #N/A | 0 |
| #N/A | 0 |
| #N/A | 0 |
| #N/A | 0 |
| #N/A | 0 |
| #N/A | 0 |
| #N/A | 0 |
| #N/A | 0 |
| #N/A | 0 |
| #N/A | 0 |
| #N/A | 0 |
| #N/A | 0 |
| #N/A | 0 |
| #N/A | 0 |
| #N/A | 0 |
| #N/A | 0 |
| #N/A | 0 |
| #N/A | 0 |
| #N/A | 0 |
| #N/A | 0 |
| #N/A | 0 |
| #N/A | 0 |
| #N/A | 0 |
| #N/A | 0 |
| #N/A | 0 |
| #N/A | 0 |
| #N/A | 0 |
| #N/A | 0 |
| #N/A | 0 |
| #N/A | 0 |
| #N/A | 0 |
| #N/A | 0 |
| #N/A | 0 |
| #N/A | 0 |
| #N/A | 0 |
| #N/A | 0 |
| #N/A | 0 |
| #N/A | 0 |
| #N/A | 0 |
| #N/A | 0 |
| #N/A | 0 |
| #N/A | 0 |
| #N/A | 0 |
| #N/A | 0 |
| #N/A | 0 |
| #N/A | 0 |
| #N/A | 0 |
| #N/A | 0 |
| #N/A | 0 |
| #N/A | 0 |
| #N/A | 0 |
| #N/A | 0 |
| #N/A | 0 |
| #N/A | 0 |
| #N/A | 0 |
| #N/A | 0 |
| #N/A | 0 |
| #N/A | 0 |
| #N/A | 0 |
| #N/A | 0 |
| #N/A | 0 |
| #N/A | 0 |
| #N/A | 0 |
| #N/A | 0 |
| #N/A | 0 |
| #N/A | 0 |
| #N/A | 0 |
| #N/A | 0 |
| #N/A | 0 |
| #N/A | 0 |
| #N/A | 0 |
| #N/A | 0 |
| #N/A | 0 |
| #N/A | 0 |
| #N/A | 0 |
| #N/A | 0 |
| #N/A | 0 |
| #N/A | 0 |
| #N/A | 0 |
| #N/A | 0 |
| #N/A | 0 |
| #N/A | 0 |
| #N/A | 0 |
| #N/A | 0 |
| #N/A | 0 |
| #N/A | 0 |
| #N/A | 0 |
| #N/A | 0 |
| #N/A | 0 |
| #N/A | 0 |
| #N/A | 0 |
| #N/A | 0 |
| #N/A | 0 |
| #N/A | 0 |
| #N/A | 0 |
| #N/A | 0 |
| #N/A | 0 |
| #N/A | 0 |
| #N/A | 0 |
| #N/A | 0 |
| #N/A | 0 |
| #N/A | 0 |
| #N/A | 0 |
| #N/A | 0 |
| #N/A | 0 |
| #N/A | 0 |
| #N/A | 0 |
| #N/A | 0 |
| #N/A | 0 |
| #N/A | 0 |
| #N/A | 0 |
| #N/A | 0 |
| #N/A | 0 |
| #N/A | 0 |
| #N/A | 0 |
| #N/A | 0 |
| #N/A | 0 |
| #N/A | 0 |
| #N/A | 0 |
| #N/A | 0 |
| #N/A | 0 |
| #N/A | 0 |
| #N/A | 0 |
| #N/A | 0 |
| #N/A | 0 |
| #N/A | 0 |
| #N/A | 0 |
| #N/A | 0 |
| #N/A | 0 |
| #N/A | 0 |
| #N/A | 0 |
| #N/A | 0 |
| #N/A | 0 |
| #N/A | 0 |
| #N/A | 0 |
| #N/A | 0 |
| #N/A | 0 |
| #N/A | 0 |
| #N/A | 0 |
| #N/A | 0 |
| #N/A | 0 |
| #N/A | 0 |
| #N/A | 0 |
| #N/A | 0 |
| #N/A | 0 |
| #N/A | 0 |
| #N/A | 0 |
| #N/A | 0 |
| #N/A | 0 |
| #N/A | 0 |
| #N/A | 0 |
| #N/A | 0 |
| #N/A | 0 |
| #N/A | 0 |
| #N/A | 0 |
| #N/A | 0 |
| #N/A | 0 |
| #N/A | 0 |
| #N/A | 0 |
| #N/A | 0 |
| #N/A | 0 |
| #N/A | 0 |
| #N/A | 0 |
| #N/A | 0 |
| #N/A | 0 |
| #N/A | 0 |
| #N/A | 0 |
| #N/A | 0 |
| #N/A | 0 |
| #N/A | 0 |
| #N/A | 0 |
| #N/A | 0 |
| #N/A | 0 |
| #N/A | 0 |
| #N/A | 0 |
| #N/A | 0 |
| #N/A | 0 |
| #N/A | 0 |
| #N/A | 0 |
| #N/A | 0 |
| #N/A | 0 |
| #N/A | 0 |
| #N/A | 0 |
| #N/A | 0 |
| #N/A | 0 |
| #N/A | 0 |
| #N/A | 0 |
| #N/A | 0 |
| #N/A | 0 |
| #N/A | 0 |
| #N/A | 0 |
| #N/A | 0 |
| #N/A | 0 |
| #N/A | 0 |
| #N/A | 0 |
| #N/A | 0 |
| #N/A | 0 |
| #N/A | 0 |
| #N/A | 0 |
| #N/A | 0 |
| #N/A | 0 |
| #N/A | 0 |
| #N/A | 0 |
| #N/A | 0 |
| #N/A | 0 |
| #N/A | 0 |
| #N/A | 0 |
| #N/A | 0 |
| #N/A | 0 |
| #N/A | 0 |
| #N/A | 0 |
| #N/A | 0 |
| #N/A | 0 |
| #N/A | 0 |
| #N/A | 0 |
| #N/A | 0 |
| #N/A | 0 |
| #N/A | 0 |
| #N/A | 0 |
| #N/A | 0 |
| #N/A | 0 |
| #N/A | 0 |
| #N/A | 0 |
| #N/A | 0 |
| #N/A | 0 |
| #N/A | 0 |
| #N/A | 0 |
| #N/A | 0 |
| #N/A | 0 |
| #N/A | 0 |
| #N/A | 0 |
| #N/A | 0 |
| #N/A | 0 |
| #N/A | 0 |
| #N/A | 0 |
| #N/A | 0 |
| #N/A | 0 |
| #N/A | 0 |
| #N/A | 0 |
| #N/A | 0 |
| #N/A | 0 |
| #N/A | 0 |
| #N/A | 0 |
| #N/A | 0 |
| #N/A | 0 |
| #N/A | 0 |
| #N/A | 0 |
| #N/A | 0 |
| #N/A | 0 |
| #N/A | 0 |
| #N/A | 0 |
| #N/A | 0 |
| #N/A | 0 |
| #N/A | 0 |
| #N/A | 0 |
| #N/A | 0 |
| #N/A | 0 |
| #N/A | 0 |
| #N/A | 0 |
| #N/A | 0 |
| #N/A | 0 |
| #N/A | 0 |
| #N/A | 0 |
| #N/A | 0 |
| #N/A | 0 |
| #N/A | 0 |
| #N/A | 0 |
| #N/A | 0 |
| #N/A | 0 |
| #N/A | 0 |
| #N/A | 0 |
| #N/A | 0 |
| #N/A | 0 |
| #N/A | 0 |
| #N/A | 0 |
| #N/A | 0 |
| #N/A | 0 |
| #N/A | 0 |
| #N/A | 0 |
| #N/A | 0 |
| #N/A | 0 |
| #N/A | 0 |
| #N/A | 0 |
| #N/A | 0 |
| #N/A | 0 |
| #N/A | 0 |
| #N/A | 0 |
| #N/A | 0 |
| #N/A | 0 |
| #N/A | 0 |
| #N/A | 0 |
| #N/A | 0 |
| #N/A | 0 |
| #N/A | 0 |
| #N/A | 0 |
| #N/A | 0 |
| #N/A | 0 |
| #N/A | 0 |
| #N/A | 0 |
| #N/A | 0 |
| #N/A | 0 |
| #N/A | 0 |
| #N/A | 0 |
| #N/A | 0 |
| #N/A | 0 |
| #N/A | 0 |
| #N/A | 0 |
| #N/A | 0 |
| #N/A | 0 |
| #N/A | 0 |
| #N/A | 0 |
| #N/A | 0 |
| #N/A | 0 |
| #N/A | 0 |
| #N/A | 0 |
| #N/A | 0 |
| #N/A | 0 |
| #N/A | 0 |
| #N/A | 0 |
| #N/A | 0 |
| #N/A | 0 |
| #N/A | 0 |
| #N/A | 0 |
| #N/A | 0 |
| #N/A | 0 |
| #N/A | 0 |
| #N/A | 0 |
| #N/A | 0 |
| #N/A | 0 |
| #N/A | 0 |
| #N/A | 0 |
| #N/A | 0 |
| #N/A | 0 |
| #N/A | 0 |
| #N/A | 0 |
| #N/A | 0 |
| #N/A | 0 |
| #N/A | 0 |
| #N/A | 0 |
| #N/A | 0 |
| #N/A | 0 |
| #N/A | 0 |
| #N/A | 0 |
| #N/A | 0 |
| #N/A | 0 |
| #N/A | 0 |
| #N/A | 0 |
| #N/A | 0 |
| #N/A | 0 |
| #N/A | 0 |
| #N/A | 0 |
| #N/A | 0 |
| #N/A | 0 |
| #N/A | 0 |
| #N/A | 0 |
| #N/A | 0 |
| #N/A | 0 |
| #N/A | 0 |
| #N/A | 0 |
| #N/A | 0 |
| #N/A | 0 |
| #N/A | 0 |
| #N/A | 0 |
| #N/A | 0 |
| #N/A | 0 |
| #N/A | 0 |
| #N/A | 0 |
| #N/A | 0 |
| #N/A | 0 |
| #N/A | 0 |
| #N/A | 0 |
| #N/A | 0 |
| #N/A | 0 |
| #N/A | 0 |
| #N/A | 0 |
| #N/A | 0 |
| #N/A | 0 |
| #N/A | 0 |
| #N/A | 0 |
| #N/A | 0 |
| #N/A | 0 |
| #N/A | 0 |
| #N/A | 0 |
| #N/A | 0 |
| #N/A | 0 |
| #N/A | 0 |
| #N/A | 0 |
| #N/A | 0 |
| #N/A | 0 |
| #N/A | 0 |
| #N/A | 0 |
| #N/A | 0 |
| #N/A | 0 |
| #N/A | 0 |
| #N/A | 0 |
| #N/A | 0 |
| #N/A | 0 |
| #N/A | 0 |
| #N/A | 0 |
| #N/A | 0 |
| #N/A | 0 |
| #N/A | 0 |
| #N/A | 0 |
| #N/A | 0 |
| #N/A | 0 |
| #N/A | 0 |
| #N/A | 0 |
| #N/A | 0 |
| #N/A | 0 |
| #N/A | 0 |
| #N/A | 0 |
| #N/A | 0 |
| #N/A | 0 |
| #N/A | 0 |
| #N/A | 0 |
| #N/A | 0 |
| #N/A | 0 |
| #N/A | 0 |
| #N/A | 0 |
| #N/A | 0 |
| #N/A | 0 |
| #N/A | 0 |
| #N/A | 0 |
| #N/A | 0 |
| #N/A | 0 |
| #N/A | 0 |
| #N/A | 0 |
| #N/A | 0 |
| #N/A | 0 |
| #N/A | 0 |
| #N/A | 0 |
| #N/A | 0 |
| #N/A | 0 |
| #N/A | 0 |
| #N/A | 0 |
| #N/A | 0 |
| #N/A | 0 |
| #N/A | 0 |
| #N/A | 0 |
| #N/A | 0 |
| #N/A | 0 |
| #N/A | 0 |
| #N/A | 0 |
| #N/A | 0 |
| #N/A | 0 |
| #N/A | 0 |
| #N/A | 0 |
| #N/A | 0 |
| #N/A | 0 |
| #N/A | 0 |
| #N/A | 0 |
| #N/A | 0 |
| #N/A | 0 |
| #N/A | 0 |
| #N/A | 0 |
| #N/A | 0 |
| #N/A | 0 |
| #N/A | 0 |
| #N/A | 0 |
| #N/A | 0 |
| #N/A | 0 |
| #N/A | 0 |
| #N/A | 0 |
| #N/A | 0 |
| #N/A | 0 |
| #N/A | 0 |
| #N/A | 0 |
| #N/A | 0 |
| #N/A | 0 |
| #N/A | 0 |
| #N/A | 0 |
| #N/A | 0 |
| #N/A | 0 |
| #N/A | 0 |
| #N/A | 0 |
| #N/A | 0 |
| #N/A | 0 |
| #N/A | 0 |
| #N/A | 0 |
| #N/A | 0 |
| #N/A | 0 |
| #N/A | 0 |
| #N/A | 0 |
| #N/A | 0 |
| #N/A | 0 |
| #N/A | 0 |
| #N/A | 0 |
| #N/A | 0 |
| #N/A | 0 |
| #N/A | 0 |
| #N/A | 0 |
| #N/A | 0 |
| #N/A | 0 |
| #N/A | 0 |
| #N/A | 0 |
| #N/A | 0 |
| #N/A | 0 |
| #N/A | 0 |
| #N/A | 0 |
| #N/A | 0 |
| #N/A | 0 |
| #N/A | 0 |
| #N/A | 0 |
| #N/A | 0 |
| #N/A | 0 |
| #N/A | 0 |
| #N/A | 0 |
| #N/A | 0 |
| #N/A | 0 |
| #N/A | 0 |
| #N/A | 0 |
| #N/A | 0 |
| #N/A | 0 |
| #N/A | 0 |
| #N/A | 0 |
| #N/A | 0 |
| #N/A | 0 |
| #N/A | 0 |
| #N/A | 0 |
| #N/A | 0 |
| #N/A | 0 |
| #N/A | 0 |
| #N/A | 0 |
| #N/A | 0 |
| #N/A | 0 |
| #N/A | 0 |
| #N/A | 0 |
| #N/A | 0 |
| #N/A | 0 |
| #N/A | 0 |
| #N/A | 0 |
| #N/A | 0 |
| #N/A | 0 |
| #N/A | 0 |
| #N/A | 0 |
| #N/A | 0 |
| #N/A | 0 |
| #N/A | 0 |
| #N/A | 0 |
| #N/A | 0 |
| #N/A | 0 |
| #N/A | 0 |
| #N/A | 0 |
| #N/A | 0 |
| #N/A | 0 |
| #N/A | 0 |
| #N/A | 0 |
| #N/A | 0 |
| #N/A | 0 |
| #N/A | 0 |
| #N/A | 0 |
| #N/A | 0 |
| #N/A | 0 |
| #N/A | 0 |
| #N/A | 0 |
| #N/A | 0 |
| #N/A | 0 |
| #N/A | 0 |
| #N/A | 0 |
| #N/A | 0 |
| #N/A | 0 |
| #N/A | 0 |
| #N/A | 0 |
| #N/A | 0 |
| #N/A | 0 |
| #N/A | 0 |
| #N/A | 0 |
| #N/A | 0 |
| #N/A | 0 |
| #N/A | 0 |
| #N/A | 0 |
| #N/A | 0 |
| #N/A | 0 |
| #N/A | 0 |
| #N/A | 0 |
| #N/A | 0 |
| #N/A | 0 |
| #N/A | 0 |
| #N/A | 0 |
| #N/A | 0 |
| #N/A | 0 |
| #N/A | 0 |
| #N/A | 0 |
| #N/A | 0 |
| #N/A | 0 |
| #N/A | 0 |
| #N/A | 0 |
| #N/A | 0 |
| #N/A | 0 |
| #N/A | 0 |
| #N/A | 0 |
| #N/A | 0 |
| #N/A | 0 |
| #N/A | 0 |
| #N/A | 0 |
| #N/A | 0 |
| #N/A | 0 |
| #N/A | 0 |
| #N/A | 0 |
| #N/A | 0 |
| #N/A | 0 |
| #N/A | 0 |
| #N/A | 0 |
| #N/A | 0 |
| #N/A | 0 |
| #N/A | 0 |
| #N/A | 0 |
| #N/A | 0 |
| #N/A | 0 |
| #N/A | 0 |
| #N/A | 0 |
| #N/A | 0 |
| #N/A | 0 |
| #N/A | 0 |
| #N/A | 0 |
| #N/A | 0 |
| #N/A | 0 |
| #N/A | 0 |
| #N/A | 0 |
| #N/A | 0 |
| #N/A | 0 |
| #N/A | 0 |
| #N/A | 0 |
| #N/A | 0 |
| #N/A | 0 |
| #N/A | 0 |
| #N/A | 0 |
| #N/A | 0 |
| #N/A | 0 |
| #N/A | 0 |
| #N/A | 0 |
| #N/A | 0 |
| #N/A | 0 |
| #N/A | 0 |
| #N/A | 0 |
| #N/A | 0 |
| #N/A | 0 |
| #N/A | 0 |
| #N/A | 0 |
| #N/A | 0 |
| #N/A | 0 |
| #N/A | 0 |
| #N/A | 0 |
| #N/A | 0 |
| #N/A | 0 |
| #N/A | 0 |
| #N/A | 0 |
| #N/A | 0 |
| #N/A | 0 |
| #N/A | 0 |
| #N/A | 0 |
| #N/A | 0 |
| #N/A | 0 |
| #N/A | 0 |
| #N/A | 0 |
| #N/A | 0 |
| #N/A | 0 |
| #N/A | 0 |
| #N/A | 0 |
| #N/A | 0 |
| #N/A | 0 |
| #N/A | 0 |
| #N/A | 0 |
| #N/A | 0 |
| #N/A | 0 |
| #N/A | 0 |
| #N/A | 0 |
| #N/A | 0 |
| #N/A | 0 |
| #N/A | 0 |
| #N/A | 0 |
| #N/A | 0 |
| #N/A | 0 |
| #N/A | 0 |
| #N/A | 0 |
| #N/A | 0 |
| #N/A | 0 |
| #N/A | 0 |
| #N/A | 0 |
| #N/A | 0 |
| #N/A | 0 |
| #N/A | 0 |
| #N/A | 0 |
| #N/A | 0 |
| #N/A | 0 |
| #N/A | 0 |
| #N/A | 0 |
| #N/A | 0 |
| #N/A | 0 |
| #N/A | 0 |
| #N/A | 0 |
| #N/A | 0 |
| #N/A | 0 |
| #N/A | 0 |
| #N/A | 0 |
| #N/A | 0 |
| #N/A | 0 |
| #N/A | 0 |
| #N/A | 0 |
| #N/A | 0 |
| #N/A | 0 |
| #N/A | 0 |
| #N/A | 0 |
| #N/A | 0 |
| #N/A | 0 |
| #N/A | 0 |
| #N/A | 0 |
| #N/A | 0 |
| #N/A | 0 |
| #N/A | 0 |
| #N/A | 0 |
| #N/A | 0 |
| #N/A | 0 |
| #N/A | 0 |
| #N/A | 0 |
| #N/A | 0 |
| #N/A | 0 |
| #N/A | 0 |
| #N/A | 0 |
| #N/A | 0 |
| #N/A | 0 |
| #N/A | 0 |
| #N/A | 0 |
| #N/A | 0 |
| #N/A | 0 |
| #N/A | 0 |
| #N/A | 0 |
| #N/A | 0 |
| #N/A | 0 |
| #N/A | 0 |
| #N/A | 0 |
| #N/A | 0 |
| #N/A | 0 |
| #N/A | 0 |
| #N/A | 0 |
| #N/A | 0 |
| #N/A | 0 |
| #N/A | 0 |
| #N/A | 0 |
| #N/A | 0 |
| #N/A | 0 |
| #N/A | 0 |
| #N/A | 0 |
| #N/A | 0 |
| #N/A | 0 |
| #N/A | 0 |
| #N/A | 0 |
| #N/A | 0 |
| #N/A | 0 |
| #N/A | 0 |
| #N/A | 0 |
| #N/A | 0 |
| #N/A | 0 |
| #N/A | 0 |
| #N/A | 0 |
| #N/A | 0 |
| #N/A | 0 |
| #N/A | 0 |
| #N/A | 0 |
| #N/A | 0 |
| #N/A | 0 |
| #N/A | 0 |
| #N/A | 0 |
| #N/A | 0 |
| #N/A | 0 |
| #N/A | 0 |
| #N/A | 0 |
| #N/A | 0 |
| #N/A | 0 |
| #N/A | 0 |
| #N/A | 0 |
| #N/A | 0 |
| #N/A | 0 |
| #N/A | 0 |
| #N/A | 0 |
| #N/A | 0 |
| #N/A | 0 |
| #N/A | 0 |
| #N/A | 0 |
| #N/A | 0 |
| #N/A | 0 |
| #N/A | 0 |
| #N/A | 0 |
| #N/A | 0 |
| #N/A | 0 |
| #N/A | 0 |
| #N/A | 0 |
| #N/A | 0 |
| #N/A | 0 |
| #N/A | 0 |
| #N/A | 0 |
| #N/A | 0 |
| #N/A | 0 |
| #N/A | 0 |
| #N/A | 0 |
| #N/A | 0 |
| #N/A | 0 |
| #N/A | 0 |
| #N/A | 0 |
| #N/A | 0 |
| #N/A | 0 |
| #N/A | 0 |
| #N/A | 0 |
| #N/A | 0 |
| #N/A | 0 |
| #N/A | 0 |
| #N/A | 0 |
| #N/A | 0 |
| #N/A | 0 |
| #N/A | 0 |
| #N/A | 0 |
| #N/A | 0 |
| #N/A | 0 |
| #N/A | 0 |
| #N/A | 0 |
| #N/A | 0 |
| #N/A | 0 |
| #N/A | 0 |
| #N/A | 0 |
| #N/A | 0 |
| #N/A | 0 |
| #N/A | 0 |
| #N/A | 0 |
| #N/A | 0 |
| #N/A | 0 |
| #N/A | 0 |
| #N/A | 0 |
| #N/A | 0 |
| #N/A | 0 |
| #N/A | 0 |
| #N/A | 0 |
| #N/A | 0 |
| #N/A | 0 |
| #N/A | 0 |
| #N/A | 0 |
| #N/A | 0 |
| #N/A | 0 |
| #N/A | 0 |
| #N/A | 0 |
| #N/A | 0 |
| #N/A | 0 |
| #N/A | 0 |
| #N/A | 0 |
| #N/A | 0 |
| #N/A | 0 |
| #N/A | 0 |
| #N/A | 0 |
| #N/A | 0 |
| #N/A | 0 |
| #N/A | 0 |
| #N/A | 0 |
| #N/A | 0 |
| #N/A | 0 |
| #N/A | 0 |
| #N/A | 0 |
| #N/A | 0 |
| #N/A | 0 |
| #N/A | 0 |
| #N/A | 0 |
| #N/A | 0 |
| #N/A | 0 |
| #N/A | 0 |
| #N/A | 0 |
| #N/A | 0 |
| #N/A | 0 |
| #N/A | 0 |
| #N/A | 0 |
| #N/A | 0 |
| #N/A | 0 |
| #N/A | 0 |
| #N/A | 0 |
| #N/A | 0 |
| #N/A | 0 |
| #N/A | 0 |
| #N/A | 0 |
| #N/A | 0 |
| #N/A | 0 |
| #N/A | 0 |
| #N/A | 0 |
| #N/A | 0 |
| #N/A | 0 |
| #N/A | 0 |
| #N/A | 0 |
| #N/A | 0 |
| #N/A | 0 |
| #N/A | 0 |
| #N/A | 0 |
| #N/A | 0 |
| #N/A | 0 |
| #N/A | 0 |
| #N/A | 0 |
| #N/A | 0 |
| #N/A | 0 |
| #N/A | 0 |
| #N/A | 0 |
| #N/A | 0 |
| #N/A | 0 |
| #N/A | 0 |
| #N/A | 0 |
| #N/A | 0 |
| #N/A | 0 |
| #N/A | 0 |
| #N/A | 0 |
| #N/A | 0 |
| #N/A | 0 |
| #N/A | 0 |
| #N/A | 0 |
| #N/A | 0 |
| #N/A | 0 |
| #N/A | 0 |
| #N/A | 0 |
| #N/A | 0 |
| #N/A | 0 |
| #N/A | 0 |
| #N/A | 0 |
| #N/A | 0 |
| #N/A | 0 |
| #N/A | 0 |
| #N/A | 0 |
| #N/A | 0 |
| #N/A | 0 |
| #N/A | 0 |
| #N/A | 0 |
| #N/A | 0 |
| #N/A | 0 |
| #N/A | 0 |
| #N/A | 0 |
| #N/A | 0 |
| #N/A | 0 |
| #N/A | 0 |
| #N/A | 0 |
| #N/A | 0 |
| #N/A | 0 |
| #N/A | 0 |
| #N/A | 0 |
| #N/A | 0 |
| #N/A | 0 |
| #N/A | 0 |
| #N/A | 0 |
| #N/A | 0 |
| #N/A | 0 |
| #N/A | 0 |
| #N/A | 0 |
| #N/A | 0 |
| #N/A | 0 |
| #N/A | 0 |
| #N/A | 0 |
| #N/A | 0 |
| #N/A | 0 |
| #N/A | 0 |
| #N/A | 0 |
| #N/A | 0 |
| #N/A | 0 |
| #N/A | 0 |
| #N/A | 0 |
| #N/A | 0 |
| #N/A | 0 |
| #N/A | 0 |
| #N/A | 0 |
| #N/A | 0 |
| #N/A | 0 |
| #N/A | 0 |
| #N/A | 0 |
| #N/A | 0 |
| #N/A | 0 |
| #N/A | 0 |
| #N/A | 0 |
| #N/A | 0 |
| #N/A | 0 |
| #N/A | 0 |
| #N/A | 0 |
| #N/A | 0 |
| #N/A | 0 |
| #N/A | 0 |
| #N/A | 0 |
| #N/A | 0 |
| #N/A | 0 |
| #N/A | 0 |
| #N/A | 0 |
| #N/A | 0 |
| #N/A | 0 |
| #N/A | 0 |
| #N/A | 0 |
| #N/A | 0 |
| #N/A | 0 |
| #N/A | 0 |
| #N/A | 0 |
| #N/A | 0 |
| #N/A | 0 |
| #N/A | 0 |
| #N/A | 0 |
| #N/A | 0 |
| #N/A | 0 |
| #N/A | 0 |
| #N/A | 0 |
| #N/A | 0 |
| #N/A | 0 |
| #N/A | 0 |
| #N/A | 0 |
| #N/A | 0 |
| #N/A | 0 |
| #N/A | 0 |
| #N/A | 0 |
| #N/A | 0 |
| #N/A | 0 |
| #N/A | 0 |
| #N/A | 0 |
| #N/A | 0 |
| #N/A | 0 |
| #N/A | 0 |
| #N/A | 0 |
| #N/A | 0 |
| #N/A | 0 |
| #N/A | 0 |
| #N/A | 0 |
| #N/A | 0 |
| #N/A | 0 |
| #N/A | 0 |
| #N/A | 0 |
| #N/A | 0 |
| #N/A | 0 |
| #N/A | 0 |
| #N/A | 0 |
| #N/A | 0 |
| #N/A | 0 |
| #N/A | 0 |
| #N/A | 0 |
| #N/A | 0 |
| #N/A | 0 |
| #N/A | 0 |
| #N/A | 0 |
| #N/A | 0 |
| #N/A | 0 |
| #N/A | 0 |
| #N/A | 0 |
| #N/A | 0 |
| #N/A | 0 |
| #N/A | 0 |
| #N/A | 0 |
| #N/A | 0 |
| #N/A | 0 |
| #N/A | 0 |
| #N/A | 0 |
| #N/A | 0 |
| #N/A | 0 |
| #N/A | 0 |
| #N/A | 0 |
| #N/A | 0 |
| #N/A | 0 |
| #N/A | 0 |
| #N/A | 0 |
| #N/A | 0 |
| #N/A | 0 |
| #N/A | 0 |
| #N/A | 0 |
| #N/A | 0 |
| #N/A | 0 |
| #N/A | 0 |
| #N/A | 0 |
| #N/A | 0 |
| #N/A | 0 |
| #N/A | 0 |
| #N/A | 0 |
| #N/A | 0 |
| #N/A | 0 |
| #N/A | 0 |
| #N/A | 0 |
| #N/A | 0 |
| #N/A | 0 |
| #N/A | 0 |
| #N/A | 0 |
| #N/A | 0 |
| #N/A | 0 |
| #N/A | 0 |
| #N/A | 0 |
| #N/A | 0 |
| #N/A | 0 |
| #N/A | 0 |
| #N/A | 0 |
| #N/A | 0 |
| #N/A | 0 |
| #N/A | 0 |
| #N/A | 0 |
| #N/A | 0 |
| #N/A | 0 |
| #N/A | 0 |
| #N/A | 0 |
| #N/A | 0 |
| #N/A | 0 |
| #N/A | 0 |
| #N/A | 0 |
| #N/A | 0 |
| #N/A | 0 |
| #N/A | 0 |
| #N/A | 0 |
| #N/A | 0 |
| #N/A | 0 |
| #N/A | 0 |
| #N/A | 0 |
| #N/A | 0 |
| #N/A | 0 |
| #N/A | 0 |
| #N/A | 0 |
| #N/A | 0 |
| #N/A | 0 |
| #N/A | 0 |
| #N/A | 0 |
| #N/A | 0 |
| #N/A | 0 |
| #N/A | 0 |
| #N/A | 0 |
| #N/A | 0 |
| #N/A | 0 |
| #N/A | 0 |
| #N/A | 0 |
| #N/A | 0 |
| #N/A | 0 |
| #N/A | 0 |
| #N/A | 0 |
| #N/A | 0 |
| #N/A | 0 |
| #N/A | 0 |
| #N/A | 0 |
| #N/A | 0 |
| #N/A | 0 |
| #N/A | 0 |
| #N/A | 0 |
| #N/A | 0 |
| #N/A | 0 |
| #N/A | 0 |
| #N/A | 0 |
| #N/A | 0 |
| #N/A | 0 |
| #N/A | 0 |
| #N/A | 0 |
| #N/A | 0 |
| #N/A | 0 |
| #N/A | 0 |
| #N/A | 0 |
| #N/A | 0 |
| #N/A | 0 |
| #N/A | 0 |
| #N/A | 0 |
| #N/A | 0 |
| #N/A | 0 |
| #N/A | 0 |
| #N/A | 0 |
| #N/A | 0 |
| #N/A | 0 |
| #N/A | 0 |
| #N/A | 0 |
| #N/A | 0 |
| #N/A | 0 |
| #N/A | 0 |
| #N/A | 0 |
| #N/A | 0 |
| #N/A | 0 |
| #N/A | 0 |
| #N/A | 0 |
| #N/A | 0 |
| #N/A | 0 |
| #N/A | 0 |
| #N/A | 0 |
| #N/A | 0 |
| #N/A | 0 |
| #N/A | 0 |
| #N/A | 0 |
| #N/A | 0 |
| #N/A | 0 |
| #N/A | 0 |
| #N/A | 0 |
| #N/A | 0 |
| #N/A | 0 |
| #N/A | 0 |
| #N/A | 0 |
| #N/A | 0 |
| #N/A | 0 |
| #N/A | 0 |
| #N/A | 0 |
| #N/A | 0 |
| #N/A | 0 |
| #N/A | 0 |
| #N/A | 0 |
| #N/A | 0 |
| #N/A | 0 |
| #N/A | 0 |
| #N/A | 0 |
| #N/A | 0 |
| #N/A | 0 |
| #N/A | 0 |
| #N/A | 0 |
| #N/A | 0 |
| #N/A | 0 |
| #N/A | 0 |
| #N/A | 0 |
| #N/A | 0 |
| #N/A | 0 |
| #N/A | 0 |
| #N/A | 0 |
| #N/A | 0 |
| #N/A | 0 |
| #N/A | 0 |
| #N/A | 0 |
| #N/A | 0 |
| #N/A | 0 |
| #N/A | 0 |
| #N/A | 0 |
| #N/A | 0 |
| #N/A | 0 |
| #N/A | 0 |
| #N/A | 0 |
| #N/A | 0 |
| #N/A | 0 |
| #N/A | 0 |
| #N/A | 0 |
| #N/A | 0 |
| #N/A | 0 |
| #N/A | 0 |
| #N/A | 0 |
| #N/A | 0 |
| #N/A | 0 |
| #N/A | 0 |
| #N/A | 0 |
| #N/A | 0 |
| #N/A | 0 |
| #N/A | 0 |
| #N/A | 0 |
| #N/A | 0 |
| #N/A | 0 |
| #N/A | 0 |
| #N/A | 0 |
| #N/A | 0 |
| #N/A | 0 |
| #N/A | 0 |
| #N/A | 0 |
| #N/A | 0 |
| #N/A | 0 |
| #N/A | 0 |
| #N/A | 0 |
| #N/A | 0 |
| #N/A | 0 |
| #N/A | 0 |
| #N/A | 0 |
| #N/A | 0 |
| #N/A | 0 |
| #N/A | 0 |
| #N/A | 0 |
| #N/A | 0 |
| #N/A | 0 |
| #N/A | 0 |
| #N/A | 0 |
| #N/A | 0 |
| #N/A | 0 |
| #N/A | 0 |
| #N/A | 0 |
| #N/A | 0 |
| #N/A | 0 |
| #N/A | 0 |
| #N/A | 0 |
| #N/A | 0 |
| #N/A | 0 |
| #N/A | 0 |
| #N/A | 0 |
| #N/A | 0 |
| #N/A | 0 |
| #N/A | 0 |
| #N/A | 0 |
| #N/A | 0 |
| #N/A | 0 |
| #N/A | 0 |
| #N/A | 0 |
| #N/A | 0 |
| #N/A | 0 |
| #N/A | 0 |
| #N/A | 0 |
| #N/A | 0 |
| #N/A | 0 |
| #N/A | 0 |
| #N/A | 0 |
| #N/A | 0 |
| #N/A | 0 |
| #N/A | 0 |
| #N/A | 0 |
| #N/A | 0 |
| #N/A | 0 |
| #N/A | 0 |
| #N/A | 0 |
| #N/A | 0 |
| #N/A | 0 |
| #N/A | 0 |
| #N/A | 0 |
| #N/A | 0 |
| #N/A | 0 |
| #N/A | 0 |
| #N/A | 0 |
| #N/A | 0 |
| #N/A | 0 |
| #N/A | 0 |
| #N/A | 0 |
| #N/A | 0 |
| #N/A | 0 |
| #N/A | 0 |
| #N/A | 0 |
| #N/A | 0 |
| #N/A | 0 |
| #N/A | 0 |
| #N/A | 0 |
| #N/A | 0 |
| #N/A | 0 |
| #N/A | 0 |
| #N/A | 0 |
| #N/A | 0 |
| #N/A | 0 |